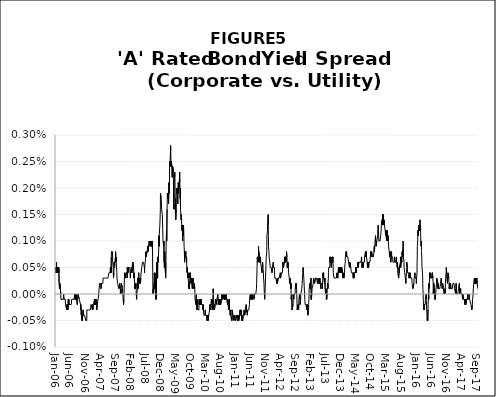
| Category | Series 1 |
|---|---|
| 2006-01-03 | 0 |
| 2006-01-04 | 0 |
| 2006-01-05 | 0.001 |
| 2006-01-06 | 0.001 |
| 2006-01-09 | 0 |
| 2006-01-10 | 0.001 |
| 2006-01-11 | 0.001 |
| 2006-01-12 | 0 |
| 2006-01-13 | 0 |
| 2006-01-17 | 0.001 |
| 2006-01-18 | 0.001 |
| 2006-01-19 | 0.001 |
| 2006-01-20 | 0.001 |
| 2006-01-23 | 0.001 |
| 2006-01-24 | 0 |
| 2006-01-25 | 0.001 |
| 2006-01-26 | 0 |
| 2006-01-27 | 0 |
| 2006-01-30 | 0.001 |
| 2006-01-31 | 0 |
| 2006-02-01 | 0 |
| 2006-02-02 | 0 |
| 2006-02-03 | 0 |
| 2006-02-06 | 0.001 |
| 2006-02-07 | 0.001 |
| 2006-02-08 | 0.001 |
| 2006-02-09 | 0 |
| 2006-02-10 | 0.001 |
| 2006-02-13 | 0 |
| 2006-02-14 | 0 |
| 2006-02-15 | 0 |
| 2006-02-16 | 0 |
| 2006-02-17 | 0 |
| 2006-02-21 | 0 |
| 2006-02-22 | 0 |
| 2006-02-23 | 0 |
| 2006-02-27 | 0 |
| 2006-02-28 | 0 |
| 2006-03-01 | 0 |
| 2006-03-02 | 0 |
| 2006-03-03 | 0 |
| 2006-03-06 | 0 |
| 2006-03-07 | 0 |
| 2006-03-08 | 0 |
| 2006-03-09 | 0 |
| 2006-03-10 | 0 |
| 2006-03-13 | 0 |
| 2006-03-14 | 0 |
| 2006-03-16 | 0 |
| 2006-03-17 | 0 |
| 2006-03-20 | 0 |
| 2006-03-21 | 0 |
| 2006-03-22 | 0 |
| 2006-03-23 | 0 |
| 2006-03-24 | 0 |
| 2006-03-27 | 0 |
| 2006-03-28 | 0 |
| 2006-03-30 | 0 |
| 2006-03-31 | 0 |
| 2006-04-03 | 0 |
| 2006-04-04 | 0 |
| 2006-04-05 | 0 |
| 2006-04-06 | 0 |
| 2006-04-10 | 0 |
| 2006-04-11 | 0 |
| 2006-04-12 | 0 |
| 2006-04-13 | 0 |
| 2006-04-17 | 0 |
| 2006-04-19 | 0 |
| 2006-04-21 | 0 |
| 2006-04-24 | 0 |
| 2006-04-25 | 0 |
| 2006-04-26 | 0 |
| 2006-04-27 | 0 |
| 2006-04-28 | 0 |
| 2006-05-01 | 0 |
| 2006-05-02 | 0 |
| 2006-05-03 | 0 |
| 2006-05-04 | 0 |
| 2006-05-05 | 0 |
| 2006-05-08 | 0 |
| 2006-05-09 | 0 |
| 2006-05-10 | 0 |
| 2006-05-11 | 0 |
| 2006-05-12 | 0 |
| 2006-05-15 | 0 |
| 2006-05-16 | 0 |
| 2006-05-17 | 0 |
| 2006-05-18 | 0 |
| 2006-05-19 | 0 |
| 2006-05-22 | 0 |
| 2006-05-24 | 0 |
| 2006-05-25 | 0 |
| 2006-05-26 | 0 |
| 2006-05-30 | 0 |
| 2006-05-31 | 0 |
| 2006-06-01 | 0 |
| 2006-06-02 | 0 |
| 2006-06-05 | 0 |
| 2006-06-06 | 0 |
| 2006-06-07 | 0 |
| 2006-06-09 | 0 |
| 2006-06-12 | 0 |
| 2006-06-13 | 0 |
| 2006-06-14 | 0 |
| 2006-06-15 | 0 |
| 2006-06-16 | 0 |
| 2006-06-19 | 0 |
| 2006-06-20 | 0 |
| 2006-06-21 | 0 |
| 2006-06-22 | 0 |
| 2006-06-23 | 0 |
| 2006-06-26 | 0 |
| 2006-06-28 | 0 |
| 2006-06-29 | 0 |
| 2006-07-03 | 0 |
| 2006-07-05 | 0 |
| 2006-07-06 | 0 |
| 2006-07-07 | 0 |
| 2006-07-10 | 0 |
| 2006-07-11 | 0 |
| 2006-07-12 | 0 |
| 2006-07-14 | 0 |
| 2006-07-17 | 0 |
| 2006-07-18 | 0 |
| 2006-07-19 | 0 |
| 2006-07-20 | 0 |
| 2006-07-21 | 0 |
| 2006-07-24 | 0 |
| 2006-07-25 | 0 |
| 2006-07-26 | 0 |
| 2006-07-27 | 0 |
| 2006-07-28 | 0 |
| 2006-07-31 | 0 |
| 2006-08-01 | 0 |
| 2006-08-02 | 0 |
| 2006-08-03 | 0 |
| 2006-08-04 | 0 |
| 2006-08-07 | 0 |
| 2006-08-08 | 0 |
| 2006-08-09 | 0 |
| 2006-08-11 | 0 |
| 2006-08-14 | 0 |
| 2006-08-15 | 0 |
| 2006-08-16 | 0 |
| 2006-08-17 | 0 |
| 2006-08-21 | 0 |
| 2006-08-23 | 0 |
| 2006-08-24 | 0 |
| 2006-08-28 | 0 |
| 2006-08-29 | 0 |
| 2006-08-30 | 0 |
| 2006-09-01 | 0 |
| 2006-09-05 | 0 |
| 2006-09-06 | 0 |
| 2006-09-07 | 0 |
| 2006-09-08 | 0 |
| 2006-09-11 | 0 |
| 2006-09-12 | 0 |
| 2006-09-14 | 0 |
| 2006-09-15 | 0 |
| 2006-09-18 | 0 |
| 2006-09-19 | 0 |
| 2006-09-20 | 0 |
| 2006-09-21 | 0 |
| 2006-09-25 | 0 |
| 2006-09-26 | 0 |
| 2006-09-28 | 0 |
| 2006-09-29 | 0 |
| 2006-10-02 | 0 |
| 2006-10-03 | 0 |
| 2006-10-04 | -0.001 |
| 2006-10-05 | 0 |
| 2006-10-06 | -0.001 |
| 2006-10-10 | 0 |
| 2006-10-11 | 0 |
| 2006-10-13 | 0 |
| 2006-10-17 | 0 |
| 2006-10-18 | 0 |
| 2006-10-19 | 0 |
| 2006-10-23 | 0 |
| 2006-10-24 | 0 |
| 2006-10-26 | 0 |
| 2006-10-27 | 0 |
| 2006-10-30 | 0 |
| 2006-10-31 | 0 |
| 2006-11-01 | 0 |
| 2006-11-03 | 0 |
| 2006-11-06 | 0 |
| 2006-11-07 | 0 |
| 2006-11-09 | -0.001 |
| 2006-11-10 | -0.001 |
| 2006-11-13 | -0.001 |
| 2006-11-15 | -0.001 |
| 2006-11-16 | -0.001 |
| 2006-11-17 | -0.001 |
| 2006-11-20 | -0.001 |
| 2006-11-21 | 0 |
| 2006-11-24 | 0 |
| 2006-11-27 | 0 |
| 2006-11-28 | 0 |
| 2006-11-30 | 0 |
| 2006-12-04 | 0 |
| 2006-12-05 | 0 |
| 2006-12-07 | 0 |
| 2006-12-08 | 0 |
| 2006-12-11 | 0 |
| 2006-12-12 | 0 |
| 2006-12-14 | 0 |
| 2006-12-15 | 0 |
| 2006-12-18 | 0 |
| 2006-12-19 | 0 |
| 2006-12-20 | 0 |
| 2006-12-21 | 0 |
| 2006-12-26 | 0 |
| 2006-12-28 | 0 |
| 2006-12-29 | 0 |
| 2007-01-02 | 0 |
| 2007-01-03 | 0 |
| 2007-01-04 | 0 |
| 2007-01-05 | 0 |
| 2007-01-08 | 0 |
| 2007-01-09 | 0 |
| 2007-01-11 | 0 |
| 2007-01-12 | 0 |
| 2007-01-17 | 0 |
| 2007-01-18 | 0 |
| 2007-01-19 | 0 |
| 2007-01-22 | 0 |
| 2007-01-23 | 0 |
| 2007-01-24 | 0 |
| 2007-01-26 | 0 |
| 2007-01-30 | 0 |
| 2007-01-31 | 0 |
| 2007-02-01 | 0 |
| 2007-02-02 | 0 |
| 2007-02-06 | 0 |
| 2007-02-07 | 0 |
| 2007-02-08 | 0 |
| 2007-02-09 | 0 |
| 2007-02-12 | 0 |
| 2007-02-13 | 0 |
| 2007-02-14 | 0 |
| 2007-02-15 | 0 |
| 2007-02-16 | 0 |
| 2007-02-20 | 0 |
| 2007-02-21 | 0 |
| 2007-02-22 | 0 |
| 2007-02-26 | 0 |
| 2007-02-27 | 0 |
| 2007-02-28 | 0 |
| 2007-03-01 | 0 |
| 2007-03-02 | 0 |
| 2007-03-05 | 0 |
| 2007-03-07 | 0 |
| 2007-03-08 | 0 |
| 2007-03-09 | 0 |
| 2007-03-12 | 0 |
| 2007-03-13 | 0 |
| 2007-03-15 | 0 |
| 2007-03-16 | 0 |
| 2007-03-19 | 0 |
| 2007-03-21 | 0 |
| 2007-03-22 | 0 |
| 2007-03-26 | 0 |
| 2007-03-28 | 0 |
| 2007-03-29 | 0 |
| 2007-03-30 | 0 |
| 2007-04-03 | 0 |
| 2007-04-04 | 0 |
| 2007-04-05 | 0 |
| 2007-04-09 | 0 |
| 2007-04-10 | 0 |
| 2007-04-12 | 0 |
| 2007-04-16 | 0 |
| 2007-04-17 | 0 |
| 2007-04-18 | 0 |
| 2007-04-19 | 0 |
| 2007-04-20 | 0 |
| 2007-04-23 | 0 |
| 2007-04-25 | 0 |
| 2007-04-27 | 0 |
| 2007-05-01 | 0 |
| 2007-05-02 | 0 |
| 2007-05-03 | 0 |
| 2007-05-04 | 0 |
| 2007-05-08 | 0 |
| 2007-05-09 | 0 |
| 2007-05-10 | 0 |
| 2007-05-14 | 0 |
| 2007-05-15 | 0 |
| 2007-05-16 | 0 |
| 2007-05-17 | 0 |
| 2007-05-18 | 0 |
| 2007-05-21 | 0 |
| 2007-05-22 | 0 |
| 2007-05-24 | 0 |
| 2007-05-25 | 0 |
| 2007-05-29 | 0 |
| 2007-05-31 | 0 |
| 2007-06-01 | 0 |
| 2007-06-04 | 0 |
| 2007-06-05 | 0 |
| 2007-06-06 | 0 |
| 2007-06-08 | 0 |
| 2007-06-11 | 0 |
| 2007-06-12 | 0 |
| 2007-06-13 | 0 |
| 2007-06-14 | 0 |
| 2007-06-18 | 0 |
| 2007-06-20 | 0 |
| 2007-06-21 | 0 |
| 2007-06-22 | 0 |
| 2007-06-26 | 0 |
| 2007-06-27 | 0 |
| 2007-06-28 | 0 |
| 2007-06-29 | 0 |
| 2007-07-02 | 0 |
| 2007-07-03 | 0 |
| 2007-07-05 | 0 |
| 2007-07-06 | 0 |
| 2007-07-09 | 0 |
| 2007-07-10 | 0 |
| 2007-07-11 | 0 |
| 2007-07-12 | 0 |
| 2007-07-13 | 0 |
| 2007-07-16 | 0 |
| 2007-07-17 | 0.001 |
| 2007-07-18 | 0 |
| 2007-07-19 | 0 |
| 2007-07-20 | 0 |
| 2007-07-23 | 0.001 |
| 2007-07-24 | 0 |
| 2007-07-26 | 0.001 |
| 2007-07-27 | 0.001 |
| 2007-07-30 | 0.001 |
| 2007-08-01 | 0.001 |
| 2007-08-02 | 0.001 |
| 2007-08-03 | 0.001 |
| 2007-08-06 | 0.001 |
| 2007-08-07 | 0.001 |
| 2007-08-09 | 0.001 |
| 2007-08-10 | 0.001 |
| 2007-08-13 | 0.001 |
| 2007-08-14 | 0.001 |
| 2007-08-15 | 0 |
| 2007-08-16 | 0 |
| 2007-08-17 | 0 |
| 2007-08-20 | 0 |
| 2007-08-21 | 0 |
| 2007-08-22 | 0.001 |
| 2007-08-23 | 0.001 |
| 2007-08-24 | 0.001 |
| 2007-08-28 | 0.001 |
| 2007-08-30 | 0.001 |
| 2007-08-31 | 0.001 |
| 2007-09-05 | 0.001 |
| 2007-09-06 | 0.001 |
| 2007-09-07 | 0.001 |
| 2007-09-10 | 0.001 |
| 2007-09-11 | 0.001 |
| 2007-09-12 | 0.001 |
| 2007-09-13 | 0.001 |
| 2007-09-17 | 0.001 |
| 2007-09-18 | 0.001 |
| 2007-09-19 | 0.001 |
| 2007-09-20 | 0 |
| 2007-09-21 | 0 |
| 2007-09-25 | 0 |
| 2007-09-26 | 0 |
| 2007-09-27 | 0 |
| 2007-09-28 | 0 |
| 2007-10-01 | 0 |
| 2007-10-03 | 0 |
| 2007-10-04 | 0 |
| 2007-10-05 | 0 |
| 2007-10-10 | 0 |
| 2007-10-11 | 0 |
| 2007-10-12 | 0 |
| 2007-10-15 | 0 |
| 2007-10-16 | 0 |
| 2007-10-18 | 0 |
| 2007-10-19 | 0 |
| 2007-10-23 | 0 |
| 2007-10-25 | 0 |
| 2007-10-26 | 0 |
| 2007-10-29 | 0 |
| 2007-10-30 | 0 |
| 2007-10-31 | 0 |
| 2007-11-01 | 0 |
| 2007-11-02 | 0 |
| 2007-11-05 | 0 |
| 2007-11-06 | 0 |
| 2007-11-08 | 0 |
| 2007-11-09 | 0 |
| 2007-11-13 | 0 |
| 2007-11-16 | 0 |
| 2007-11-19 | 0 |
| 2007-11-23 | 0 |
| 2007-11-26 | 0 |
| 2007-11-27 | 0 |
| 2007-11-28 | 0 |
| 2007-11-30 | 0 |
| 2007-12-03 | 0 |
| 2007-12-05 | 0 |
| 2007-12-07 | 0 |
| 2007-12-10 | 0 |
| 2007-12-11 | 0 |
| 2007-12-12 | 0 |
| 2007-12-13 | 0 |
| 2007-12-14 | 0 |
| 2007-12-17 | 0 |
| 2007-12-18 | 0 |
| 2007-12-19 | 0 |
| 2007-12-20 | 0 |
| 2007-12-24 | 0 |
| 2007-12-27 | 0 |
| 2007-12-31 | 0 |
| 2008-01-02 | 0 |
| 2008-01-04 | 0.001 |
| 2008-01-07 | 0.001 |
| 2008-01-08 | 0 |
| 2008-01-09 | 0 |
| 2008-01-10 | 0 |
| 2008-01-14 | 0 |
| 2008-01-15 | 0 |
| 2008-01-16 | 0 |
| 2008-01-17 | 0.001 |
| 2008-01-18 | 0.001 |
| 2008-01-22 | 0.001 |
| 2008-01-24 | 0 |
| 2008-01-25 | 0 |
| 2008-01-29 | 0.001 |
| 2008-01-30 | 0.001 |
| 2008-02-01 | 0 |
| 2008-02-04 | 0 |
| 2008-02-05 | 0 |
| 2008-02-06 | 0 |
| 2008-02-07 | 0 |
| 2008-02-08 | 0 |
| 2008-02-11 | 0 |
| 2008-02-12 | 0 |
| 2008-02-14 | 0.001 |
| 2008-02-15 | 0.001 |
| 2008-02-20 | 0 |
| 2008-02-21 | 0 |
| 2008-02-22 | 0.001 |
| 2008-02-25 | 0.001 |
| 2008-02-26 | 0.001 |
| 2008-02-27 | 0.001 |
| 2008-02-28 | 0.001 |
| 2008-02-29 | 0.001 |
| 2008-03-03 | 0.001 |
| 2008-03-04 | 0.001 |
| 2008-03-05 | 0.001 |
| 2008-03-06 | 0.001 |
| 2008-03-07 | 0.001 |
| 2008-03-10 | 0 |
| 2008-03-11 | 0 |
| 2008-03-12 | 0 |
| 2008-03-13 | 0 |
| 2008-03-14 | 0 |
| 2008-03-17 | 0 |
| 2008-03-18 | 0 |
| 2008-03-19 | 0 |
| 2008-03-20 | 0 |
| 2008-03-24 | 0 |
| 2008-03-25 | 0 |
| 2008-03-26 | 0 |
| 2008-03-27 | 0 |
| 2008-03-28 | 0 |
| 2008-03-31 | 0 |
| 2008-04-01 | 0 |
| 2008-04-02 | 0 |
| 2008-04-03 | 0 |
| 2008-04-04 | 0 |
| 2008-04-07 | 0 |
| 2008-04-08 | 0 |
| 2008-04-09 | 0 |
| 2008-04-10 | 0 |
| 2008-04-11 | 0 |
| 2008-04-15 | 0 |
| 2008-04-16 | 0 |
| 2008-04-17 | 0 |
| 2008-04-18 | 0 |
| 2008-04-21 | 0 |
| 2008-04-22 | 0 |
| 2008-04-23 | 0 |
| 2008-04-24 | 0 |
| 2008-04-25 | 0 |
| 2008-04-28 | 0 |
| 2008-04-29 | 0 |
| 2008-04-30 | 0 |
| 2008-05-01 | 0 |
| 2008-05-02 | 0 |
| 2008-05-05 | 0 |
| 2008-05-06 | 0 |
| 2008-05-07 | 0 |
| 2008-05-08 | 0 |
| 2008-05-09 | 0 |
| 2008-05-12 | 0 |
| 2008-05-13 | 0 |
| 2008-05-15 | 0 |
| 2008-05-16 | 0 |
| 2008-05-19 | 0 |
| 2008-05-20 | 0 |
| 2008-05-21 | 0 |
| 2008-05-22 | 0 |
| 2008-05-23 | 0 |
| 2008-05-27 | 0 |
| 2008-05-28 | 0 |
| 2008-05-29 | 0.001 |
| 2008-05-30 | 0.001 |
| 2008-06-02 | 0.001 |
| 2008-06-03 | 0.001 |
| 2008-06-04 | 0.001 |
| 2008-06-05 | 0.001 |
| 2008-06-06 | 0.001 |
| 2008-06-09 | 0.001 |
| 2008-06-10 | 0.001 |
| 2008-06-11 | 0.001 |
| 2008-06-13 | 0.001 |
| 2008-06-16 | 0.001 |
| 2008-06-17 | 0.001 |
| 2008-06-18 | 0.001 |
| 2008-06-19 | 0.001 |
| 2008-06-20 | 0.001 |
| 2008-06-23 | 0.001 |
| 2008-06-24 | 0.001 |
| 2008-06-25 | 0.001 |
| 2008-06-26 | 0 |
| 2008-06-27 | 0.001 |
| 2008-06-30 | 0.001 |
| 2008-07-01 | 0.001 |
| 2008-07-02 | 0.001 |
| 2008-07-03 | 0.001 |
| 2008-07-07 | 0.001 |
| 2008-07-08 | 0.001 |
| 2008-07-09 | 0.001 |
| 2008-07-10 | 0.001 |
| 2008-07-11 | 0.001 |
| 2008-07-14 | 0.001 |
| 2008-07-15 | 0.001 |
| 2008-07-16 | 0.001 |
| 2008-07-17 | 0.001 |
| 2008-07-18 | 0.001 |
| 2008-07-21 | 0.001 |
| 2008-07-22 | 0.001 |
| 2008-07-23 | 0.001 |
| 2008-07-24 | 0.001 |
| 2008-07-25 | 0.001 |
| 2008-07-28 | 0.001 |
| 2008-07-29 | 0.001 |
| 2008-07-30 | 0.001 |
| 2008-07-31 | 0.001 |
| 2008-08-01 | 0.001 |
| 2008-08-04 | 0.001 |
| 2008-08-05 | 0.001 |
| 2008-08-06 | 0.001 |
| 2008-08-07 | 0.001 |
| 2008-08-11 | 0.001 |
| 2008-08-12 | 0.001 |
| 2008-08-13 | 0.001 |
| 2008-08-14 | 0.001 |
| 2008-08-15 | 0.001 |
| 2008-08-18 | 0.001 |
| 2008-08-19 | 0.001 |
| 2008-08-20 | 0.001 |
| 2008-08-21 | 0.001 |
| 2008-08-22 | 0.001 |
| 2008-08-25 | 0.001 |
| 2008-08-26 | 0.001 |
| 2008-08-27 | 0.001 |
| 2008-08-28 | 0.001 |
| 2008-08-29 | 0.001 |
| 2008-09-02 | 0.001 |
| 2008-09-03 | 0.001 |
| 2008-09-04 | 0.001 |
| 2008-09-05 | 0.001 |
| 2008-09-08 | 0.001 |
| 2008-09-09 | 0.001 |
| 2008-09-10 | 0.001 |
| 2008-09-11 | 0.001 |
| 2008-09-12 | 0.001 |
| 2008-09-15 | 0.001 |
| 2008-09-17 | 0 |
| 2008-09-18 | 0 |
| 2008-09-19 | 0 |
| 2008-09-22 | 0 |
| 2008-09-23 | 0 |
| 2008-09-25 | 0 |
| 2008-09-29 | 0 |
| 2008-09-30 | 0 |
| 2008-10-01 | 0 |
| 2008-10-03 | 0 |
| 2008-10-06 | 0 |
| 2008-10-07 | 0 |
| 2008-10-08 | 0 |
| 2008-10-09 | 0 |
| 2008-10-10 | 0 |
| 2008-10-14 | 0 |
| 2008-10-15 | 0 |
| 2008-10-16 | 0 |
| 2008-10-17 | 0 |
| 2008-10-20 | 0 |
| 2008-10-21 | 0 |
| 2008-10-22 | 0 |
| 2008-10-23 | 0 |
| 2008-10-24 | 0 |
| 2008-10-27 | 0 |
| 2008-10-28 | 0.001 |
| 2008-10-29 | 0 |
| 2008-10-30 | 0.001 |
| 2008-10-31 | 0.001 |
| 2008-11-03 | 0 |
| 2008-11-04 | 0 |
| 2008-11-05 | 0 |
| 2008-11-06 | 0.001 |
| 2008-11-07 | 0.001 |
| 2008-11-10 | 0.001 |
| 2008-11-12 | 0.001 |
| 2008-11-13 | 0.001 |
| 2008-11-14 | 0.001 |
| 2008-11-17 | 0.001 |
| 2008-11-18 | 0.001 |
| 2008-11-19 | 0.001 |
| 2008-11-20 | 0.001 |
| 2008-11-21 | 0.001 |
| 2008-11-24 | 0.001 |
| 2008-11-25 | 0.001 |
| 2008-11-28 | 0.001 |
| 2008-12-01 | 0.001 |
| 2008-12-02 | 0.001 |
| 2008-12-03 | 0.002 |
| 2008-12-04 | 0.002 |
| 2008-12-05 | 0.002 |
| 2008-12-08 | 0.002 |
| 2008-12-09 | 0.002 |
| 2008-12-10 | 0.002 |
| 2008-12-11 | 0.002 |
| 2008-12-12 | 0.002 |
| 2008-12-15 | 0.002 |
| 2008-12-16 | 0.002 |
| 2008-12-17 | 0.002 |
| 2008-12-18 | 0.002 |
| 2008-12-19 | 0.002 |
| 2008-12-23 | 0.001 |
| 2008-12-30 | 0.001 |
| 2009-01-02 | 0.001 |
| 2009-01-05 | 0.001 |
| 2009-01-06 | 0.001 |
| 2009-01-07 | 0.001 |
| 2009-01-08 | 0.001 |
| 2009-01-09 | 0.001 |
| 2009-01-12 | 0.001 |
| 2009-01-13 | 0.001 |
| 2009-01-14 | 0.001 |
| 2009-01-15 | 0.001 |
| 2009-01-16 | 0.001 |
| 2009-01-23 | 0 |
| 2009-01-26 | 0 |
| 2009-01-28 | 0.001 |
| 2009-01-29 | 0.001 |
| 2009-01-30 | 0.001 |
| 2009-02-02 | 0.001 |
| 2009-02-03 | 0.001 |
| 2009-02-04 | 0.001 |
| 2009-02-05 | 0.001 |
| 2009-02-06 | 0.001 |
| 2009-02-09 | 0.002 |
| 2009-02-10 | 0.002 |
| 2009-02-11 | 0.002 |
| 2009-02-12 | 0.002 |
| 2009-02-13 | 0.002 |
| 2009-02-17 | 0.002 |
| 2009-02-18 | 0.002 |
| 2009-02-19 | 0.002 |
| 2009-02-20 | 0.002 |
| 2009-02-23 | 0.002 |
| 2009-02-24 | 0.002 |
| 2009-02-25 | 0.002 |
| 2009-02-26 | 0.002 |
| 2009-02-27 | 0.002 |
| 2009-03-02 | 0.002 |
| 2009-03-03 | 0.002 |
| 2009-03-04 | 0.002 |
| 2009-03-05 | 0.002 |
| 2009-03-06 | 0.002 |
| 2009-03-09 | 0.003 |
| 2009-03-10 | 0.002 |
| 2009-03-11 | 0.003 |
| 2009-03-12 | 0.003 |
| 2009-03-13 | 0.003 |
| 2009-03-16 | 0.003 |
| 2009-03-17 | 0.003 |
| 2009-03-18 | 0.003 |
| 2009-03-19 | 0.003 |
| 2009-03-20 | 0.003 |
| 2009-03-23 | 0.002 |
| 2009-03-24 | 0.003 |
| 2009-03-25 | 0.003 |
| 2009-03-30 | 0.002 |
| 2009-03-31 | 0.002 |
| 2009-04-01 | 0.002 |
| 2009-04-02 | 0.002 |
| 2009-04-03 | 0.002 |
| 2009-04-06 | 0.002 |
| 2009-04-07 | 0.002 |
| 2009-04-08 | 0.002 |
| 2009-04-09 | 0.002 |
| 2009-04-13 | 0.002 |
| 2009-04-14 | 0.002 |
| 2009-04-15 | 0.002 |
| 2009-04-16 | 0.002 |
| 2009-04-17 | 0.002 |
| 2009-04-20 | 0.002 |
| 2009-04-21 | 0.002 |
| 2009-04-22 | 0.002 |
| 2009-04-23 | 0.002 |
| 2009-04-24 | 0.002 |
| 2009-04-27 | 0.002 |
| 2009-04-28 | 0.002 |
| 2009-04-29 | 0.002 |
| 2009-04-30 | 0.002 |
| 2009-05-01 | 0.002 |
| 2009-05-04 | 0.002 |
| 2009-05-05 | 0.002 |
| 2009-05-06 | 0.002 |
| 2009-05-07 | 0.002 |
| 2009-05-08 | 0.001 |
| 2009-05-11 | 0.001 |
| 2009-05-12 | 0.002 |
| 2009-05-13 | 0.002 |
| 2009-05-14 | 0.002 |
| 2009-05-15 | 0.002 |
| 2009-05-18 | 0.002 |
| 2009-05-19 | 0.002 |
| 2009-05-20 | 0.002 |
| 2009-05-21 | 0.002 |
| 2009-05-22 | 0.002 |
| 2009-05-26 | 0.002 |
| 2009-05-27 | 0.002 |
| 2009-05-28 | 0.002 |
| 2009-05-29 | 0.002 |
| 2009-06-01 | 0.002 |
| 2009-06-02 | 0.002 |
| 2009-06-03 | 0.002 |
| 2009-06-04 | 0.002 |
| 2009-06-05 | 0.002 |
| 2009-06-09 | 0.002 |
| 2009-06-10 | 0.002 |
| 2009-06-11 | 0.002 |
| 2009-06-12 | 0.002 |
| 2009-06-15 | 0.002 |
| 2009-06-16 | 0.002 |
| 2009-06-17 | 0.002 |
| 2009-06-18 | 0.002 |
| 2009-06-19 | 0.002 |
| 2009-06-22 | 0.002 |
| 2009-06-23 | 0.002 |
| 2009-06-24 | 0.002 |
| 2009-06-25 | 0.002 |
| 2009-06-26 | 0.002 |
| 2009-06-29 | 0.002 |
| 2009-06-30 | 0.002 |
| 2009-07-01 | 0.001 |
| 2009-07-02 | 0.002 |
| 2009-07-06 | 0.001 |
| 2009-07-07 | 0.001 |
| 2009-07-08 | 0.001 |
| 2009-07-09 | 0.001 |
| 2009-07-10 | 0.001 |
| 2009-07-13 | 0.001 |
| 2009-07-14 | 0.001 |
| 2009-07-16 | 0.001 |
| 2009-07-17 | 0.001 |
| 2009-07-20 | 0.001 |
| 2009-07-21 | 0.001 |
| 2009-07-22 | 0.001 |
| 2009-07-23 | 0.001 |
| 2009-07-24 | 0.001 |
| 2009-07-27 | 0.001 |
| 2009-07-28 | 0.001 |
| 2009-07-29 | 0.001 |
| 2009-07-30 | 0.001 |
| 2009-07-31 | 0.001 |
| 2009-08-03 | 0.001 |
| 2009-08-04 | 0.001 |
| 2009-08-05 | 0.001 |
| 2009-08-06 | 0.001 |
| 2009-08-07 | 0.001 |
| 2009-08-10 | 0.001 |
| 2009-08-11 | 0.001 |
| 2009-08-12 | 0.001 |
| 2009-08-13 | 0.001 |
| 2009-08-14 | 0.001 |
| 2009-08-17 | 0.001 |
| 2009-08-18 | 0.001 |
| 2009-08-19 | 0.001 |
| 2009-08-20 | 0.001 |
| 2009-08-21 | 0.001 |
| 2009-08-24 | 0.001 |
| 2009-08-25 | 0.001 |
| 2009-08-26 | 0.001 |
| 2009-08-27 | 0.001 |
| 2009-08-28 | 0.001 |
| 2009-08-31 | 0 |
| 2009-09-01 | 0 |
| 2009-09-02 | 0.001 |
| 2009-09-03 | 0 |
| 2009-09-04 | 0 |
| 2009-09-08 | 0 |
| 2009-09-09 | 0 |
| 2009-09-10 | 0 |
| 2009-09-11 | 0 |
| 2009-09-14 | 0 |
| 2009-09-15 | 0 |
| 2009-09-16 | 0 |
| 2009-09-17 | 0 |
| 2009-09-18 | 0 |
| 2009-09-21 | 0 |
| 2009-09-22 | 0 |
| 2009-09-23 | 0 |
| 2009-09-24 | 0 |
| 2009-09-25 | 0 |
| 2009-09-28 | 0 |
| 2009-09-29 | 0 |
| 2009-09-30 | 0 |
| 2009-10-01 | 0 |
| 2009-10-02 | 0 |
| 2009-10-05 | 0 |
| 2009-10-06 | 0 |
| 2009-10-07 | 0 |
| 2009-10-08 | 0 |
| 2009-10-09 | 0 |
| 2009-10-13 | 0 |
| 2009-10-14 | 0 |
| 2009-10-15 | 0 |
| 2009-10-16 | 0 |
| 2009-10-19 | 0 |
| 2009-10-20 | 0 |
| 2009-10-21 | 0 |
| 2009-10-22 | 0 |
| 2009-10-23 | 0 |
| 2009-10-29 | 0 |
| 2009-10-30 | 0 |
| 2009-11-02 | 0 |
| 2009-11-03 | 0 |
| 2009-11-04 | 0 |
| 2009-11-05 | 0 |
| 2009-11-06 | 0 |
| 2009-11-09 | 0 |
| 2009-11-10 | 0 |
| 2009-11-12 | 0 |
| 2009-11-13 | 0 |
| 2009-11-16 | 0 |
| 2009-11-17 | 0 |
| 2009-11-18 | 0 |
| 2009-11-19 | 0 |
| 2009-11-20 | 0 |
| 2009-11-27 | 0 |
| 2009-11-30 | 0 |
| 2009-12-01 | 0 |
| 2009-12-02 | 0 |
| 2009-12-03 | 0 |
| 2009-12-08 | 0 |
| 2009-12-09 | 0 |
| 2009-12-10 | 0 |
| 2009-12-11 | 0 |
| 2009-12-14 | 0 |
| 2009-12-15 | 0 |
| 2009-12-16 | 0 |
| 2009-12-17 | 0 |
| 2009-12-18 | 0 |
| 2009-12-21 | 0 |
| 2009-12-22 | 0 |
| 2009-12-24 | 0 |
| 2009-12-28 | 0 |
| 2009-12-29 | 0 |
| 2009-12-30 | 0 |
| 2009-12-31 | 0 |
| 2010-01-04 | 0 |
| 2010-01-05 | 0 |
| 2010-01-06 | 0 |
| 2010-01-07 | 0 |
| 2010-01-08 | 0 |
| 2010-01-11 | 0 |
| 2010-01-12 | 0 |
| 2010-01-13 | 0 |
| 2010-01-14 | 0 |
| 2010-01-15 | 0 |
| 2010-01-19 | 0 |
| 2010-01-20 | 0 |
| 2010-01-21 | 0 |
| 2010-01-22 | 0 |
| 2010-01-25 | 0 |
| 2010-01-26 | 0 |
| 2010-01-27 | 0 |
| 2010-01-28 | 0 |
| 2010-01-29 | 0 |
| 2010-02-01 | 0 |
| 2010-02-02 | 0 |
| 2010-02-03 | 0 |
| 2010-02-04 | 0 |
| 2010-02-05 | 0 |
| 2010-02-08 | 0 |
| 2010-02-09 | 0 |
| 2010-02-10 | 0 |
| 2010-02-11 | 0 |
| 2010-02-12 | 0 |
| 2010-02-16 | 0 |
| 2010-02-17 | 0 |
| 2010-02-18 | 0 |
| 2010-02-19 | 0 |
| 2010-02-22 | 0 |
| 2010-02-23 | 0 |
| 2010-02-24 | 0 |
| 2010-02-25 | 0 |
| 2010-02-26 | 0 |
| 2010-03-01 | 0 |
| 2010-03-02 | 0 |
| 2010-03-03 | 0 |
| 2010-03-04 | 0 |
| 2010-03-05 | 0 |
| 2010-03-08 | 0 |
| 2010-03-09 | 0 |
| 2010-03-12 | 0 |
| 2010-03-15 | 0 |
| 2010-03-16 | 0 |
| 2010-03-17 | 0 |
| 2010-03-18 | 0 |
| 2010-03-19 | -0.001 |
| 2010-03-22 | -0.001 |
| 2010-03-23 | 0 |
| 2010-03-24 | 0 |
| 2010-03-25 | -0.001 |
| 2010-03-26 | -0.001 |
| 2010-03-29 | -0.001 |
| 2010-03-30 | -0.001 |
| 2010-03-31 | 0 |
| 2010-04-01 | 0 |
| 2010-04-02 | -0.001 |
| 2010-04-05 | -0.001 |
| 2010-04-06 | 0 |
| 2010-04-07 | 0 |
| 2010-04-08 | 0 |
| 2010-04-09 | 0 |
| 2010-04-12 | 0 |
| 2010-04-13 | 0 |
| 2010-04-14 | 0 |
| 2010-04-15 | 0 |
| 2010-04-16 | 0 |
| 2010-04-19 | 0 |
| 2010-04-21 | 0 |
| 2010-04-22 | 0 |
| 2010-04-23 | 0 |
| 2010-04-26 | 0 |
| 2010-04-28 | 0 |
| 2010-04-29 | 0 |
| 2010-04-30 | 0 |
| 2010-05-03 | 0 |
| 2010-05-04 | 0 |
| 2010-05-05 | 0 |
| 2010-05-06 | 0 |
| 2010-05-07 | 0 |
| 2010-05-10 | 0 |
| 2010-05-11 | 0 |
| 2010-05-12 | 0 |
| 2010-05-13 | 0 |
| 2010-05-14 | 0 |
| 2010-05-17 | 0 |
| 2010-05-18 | 0 |
| 2010-05-19 | 0 |
| 2010-05-21 | 0 |
| 2010-05-24 | 0 |
| 2010-05-25 | 0 |
| 2010-05-26 | 0 |
| 2010-05-27 | 0 |
| 2010-05-28 | 0 |
| 2010-06-01 | 0 |
| 2010-06-02 | 0 |
| 2010-06-03 | 0 |
| 2010-06-04 | 0 |
| 2010-06-07 | 0 |
| 2010-06-08 | 0 |
| 2010-06-09 | 0 |
| 2010-06-10 | 0 |
| 2010-06-11 | 0 |
| 2010-06-14 | 0 |
| 2010-06-15 | 0 |
| 2010-06-16 | 0 |
| 2010-06-17 | 0 |
| 2010-06-18 | 0 |
| 2010-06-21 | 0 |
| 2010-06-22 | 0 |
| 2010-06-23 | 0 |
| 2010-06-25 | 0 |
| 2010-06-28 | 0 |
| 2010-07-01 | 0 |
| 2010-07-02 | 0 |
| 2010-07-06 | 0 |
| 2010-07-07 | 0 |
| 2010-07-09 | 0 |
| 2010-07-12 | 0 |
| 2010-07-13 | 0 |
| 2010-07-14 | 0 |
| 2010-07-15 | 0 |
| 2010-07-19 | 0 |
| 2010-07-20 | 0 |
| 2010-07-21 | 0 |
| 2010-07-22 | 0 |
| 2010-07-23 | 0 |
| 2010-07-26 | 0 |
| 2010-07-27 | 0 |
| 2010-07-28 | 0 |
| 2010-07-29 | 0 |
| 2010-07-30 | 0 |
| 2010-08-02 | 0 |
| 2010-08-03 | 0 |
| 2010-08-04 | 0 |
| 2010-08-05 | 0 |
| 2010-08-06 | 0 |
| 2010-08-09 | 0 |
| 2010-08-10 | 0 |
| 2010-08-12 | 0 |
| 2010-08-13 | 0 |
| 2010-08-16 | 0 |
| 2010-08-17 | 0 |
| 2010-08-19 | 0 |
| 2010-08-20 | 0 |
| 2010-08-23 | 0 |
| 2010-08-24 | 0 |
| 2010-08-27 | 0 |
| 2010-08-31 | 0 |
| 2010-09-01 | 0 |
| 2010-09-02 | 0 |
| 2010-09-03 | 0 |
| 2010-09-07 | 0 |
| 2010-09-08 | 0 |
| 2010-09-09 | 0 |
| 2010-09-10 | 0 |
| 2010-09-13 | 0 |
| 2010-09-14 | 0 |
| 2010-09-15 | 0 |
| 2010-09-16 | 0 |
| 2010-09-17 | 0 |
| 2010-09-20 | 0 |
| 2010-09-21 | 0 |
| 2010-09-22 | 0 |
| 2010-09-23 | 0 |
| 2010-09-24 | 0 |
| 2010-09-27 | 0 |
| 2010-09-28 | 0 |
| 2010-09-29 | 0 |
| 2010-09-30 | 0 |
| 2010-10-01 | 0 |
| 2010-10-04 | 0 |
| 2010-10-05 | 0 |
| 2010-10-06 | 0 |
| 2010-10-07 | 0 |
| 2010-10-08 | 0 |
| 2010-10-12 | 0 |
| 2010-10-13 | 0 |
| 2010-10-14 | 0 |
| 2010-10-15 | 0 |
| 2010-10-18 | 0 |
| 2010-10-19 | 0 |
| 2010-10-21 | 0 |
| 2010-10-25 | 0 |
| 2010-10-26 | 0 |
| 2010-10-27 | 0 |
| 2010-10-29 | 0 |
| 2010-11-01 | 0 |
| 2010-11-02 | 0 |
| 2010-11-03 | 0 |
| 2010-11-04 | 0 |
| 2010-11-05 | 0 |
| 2010-11-08 | 0 |
| 2010-11-09 | 0 |
| 2010-11-10 | 0 |
| 2010-11-11 | 0 |
| 2010-11-12 | 0 |
| 2010-11-15 | 0 |
| 2010-11-16 | 0 |
| 2010-11-17 | 0 |
| 2010-11-18 | 0 |
| 2010-11-19 | 0 |
| 2010-11-23 | -0.001 |
| 2010-11-26 | -0.001 |
| 2010-11-29 | 0 |
| 2010-11-30 | 0 |
| 2010-12-01 | 0 |
| 2010-12-03 | 0 |
| 2010-12-06 | 0 |
| 2010-12-07 | 0 |
| 2010-12-08 | 0 |
| 2010-12-09 | -0.001 |
| 2010-12-10 | -0.001 |
| 2010-12-13 | -0.001 |
| 2010-12-14 | -0.001 |
| 2010-12-15 | -0.001 |
| 2010-12-16 | 0 |
| 2010-12-17 | 0 |
| 2010-12-20 | 0 |
| 2010-12-21 | 0 |
| 2010-12-22 | 0 |
| 2010-12-23 | 0 |
| 2010-12-27 | 0 |
| 2010-12-28 | 0 |
| 2010-12-29 | -0.001 |
| 2010-12-31 | 0 |
| 2011-01-03 | -0.001 |
| 2011-01-04 | -0.001 |
| 2011-01-05 | -0.001 |
| 2011-01-06 | -0.001 |
| 2011-01-07 | -0.001 |
| 2011-01-10 | 0 |
| 2011-01-11 | 0 |
| 2011-01-12 | 0 |
| 2011-01-13 | 0 |
| 2011-01-14 | 0 |
| 2011-01-18 | 0 |
| 2011-01-19 | 0 |
| 2011-01-20 | 0 |
| 2011-01-21 | -0.001 |
| 2011-01-24 | -0.001 |
| 2011-01-25 | 0 |
| 2011-01-26 | -0.001 |
| 2011-01-28 | 0 |
| 2011-01-31 | 0 |
| 2011-02-02 | 0 |
| 2011-02-03 | 0 |
| 2011-02-04 | -0.001 |
| 2011-02-07 | -0.001 |
| 2011-02-08 | -0.001 |
| 2011-02-11 | -0.001 |
| 2011-02-14 | 0 |
| 2011-02-15 | 0 |
| 2011-02-16 | 0 |
| 2011-02-17 | 0 |
| 2011-02-18 | 0 |
| 2011-02-22 | 0 |
| 2011-02-23 | 0 |
| 2011-02-24 | 0 |
| 2011-02-25 | 0 |
| 2011-02-28 | 0 |
| 2011-03-01 | 0 |
| 2011-03-02 | 0 |
| 2011-03-03 | 0 |
| 2011-03-04 | -0.001 |
| 2011-03-07 | 0 |
| 2011-03-08 | 0 |
| 2011-03-09 | -0.001 |
| 2011-03-10 | 0 |
| 2011-03-11 | 0 |
| 2011-03-15 | 0 |
| 2011-03-16 | -0.001 |
| 2011-03-18 | -0.001 |
| 2011-03-21 | 0 |
| 2011-03-22 | 0 |
| 2011-03-23 | 0 |
| 2011-03-24 | 0 |
| 2011-03-25 | 0 |
| 2011-03-28 | 0 |
| 2011-03-29 | 0 |
| 2011-03-30 | 0 |
| 2011-03-31 | 0 |
| 2011-04-01 | 0 |
| 2011-04-04 | 0 |
| 2011-04-05 | 0 |
| 2011-04-06 | 0 |
| 2011-04-07 | 0 |
| 2011-04-08 | 0 |
| 2011-04-12 | 0 |
| 2011-04-13 | 0 |
| 2011-04-14 | 0 |
| 2011-04-15 | 0 |
| 2011-04-18 | 0 |
| 2011-04-19 | 0 |
| 2011-04-20 | 0 |
| 2011-04-21 | 0 |
| 2011-04-25 | 0 |
| 2011-04-26 | 0 |
| 2011-04-27 | 0 |
| 2011-04-28 | 0 |
| 2011-05-02 | 0 |
| 2011-05-04 | 0 |
| 2011-05-05 | 0 |
| 2011-05-06 | 0 |
| 2011-05-09 | 0 |
| 2011-05-10 | 0 |
| 2011-05-11 | 0 |
| 2011-05-13 | 0 |
| 2011-05-16 | 0 |
| 2011-05-17 | 0 |
| 2011-05-18 | 0 |
| 2011-05-19 | 0 |
| 2011-05-20 | 0 |
| 2011-05-23 | 0 |
| 2011-05-24 | 0 |
| 2011-05-25 | 0 |
| 2011-05-26 | 0 |
| 2011-05-31 | 0 |
| 2011-06-01 | 0 |
| 2011-06-02 | 0 |
| 2011-06-03 | 0 |
| 2011-06-06 | 0 |
| 2011-06-07 | 0 |
| 2011-06-08 | 0 |
| 2011-06-09 | 0 |
| 2011-06-10 | 0 |
| 2011-06-13 | 0 |
| 2011-06-14 | 0 |
| 2011-06-15 | 0 |
| 2011-06-16 | 0 |
| 2011-06-17 | 0 |
| 2011-06-20 | 0 |
| 2011-06-21 | 0 |
| 2011-06-23 | 0 |
| 2011-06-24 | 0 |
| 2011-06-27 | 0 |
| 2011-06-28 | 0 |
| 2011-06-29 | 0 |
| 2011-07-05 | 0 |
| 2011-07-06 | 0 |
| 2011-07-07 | 0 |
| 2011-07-08 | 0 |
| 2011-07-12 | 0 |
| 2011-07-13 | 0 |
| 2011-07-14 | 0 |
| 2011-07-15 | 0 |
| 2011-07-18 | 0 |
| 2011-07-19 | 0 |
| 2011-07-20 | 0 |
| 2011-07-21 | 0 |
| 2011-07-22 | 0 |
| 2011-07-25 | 0 |
| 2011-07-26 | 0 |
| 2011-07-27 | 0 |
| 2011-07-28 | 0 |
| 2011-07-29 | 0 |
| 2011-08-01 | 0 |
| 2011-08-02 | 0 |
| 2011-08-03 | 0 |
| 2011-08-04 | 0 |
| 2011-08-05 | 0 |
| 2011-08-08 | 0.001 |
| 2011-08-09 | 0.001 |
| 2011-08-10 | 0.001 |
| 2011-08-11 | 0.001 |
| 2011-08-12 | 0.001 |
| 2011-08-15 | 0.001 |
| 2011-08-16 | 0.001 |
| 2011-08-17 | 0.001 |
| 2011-08-18 | 0.001 |
| 2011-08-19 | 0.001 |
| 2011-08-22 | 0.001 |
| 2011-08-23 | 0.001 |
| 2011-08-24 | 0.001 |
| 2011-08-25 | 0.001 |
| 2011-08-26 | 0.001 |
| 2011-08-29 | 0.001 |
| 2011-08-30 | 0.001 |
| 2011-08-31 | 0.001 |
| 2011-09-01 | 0.001 |
| 2011-09-02 | 0.001 |
| 2011-09-06 | 0.001 |
| 2011-09-07 | 0.001 |
| 2011-09-09 | 0.001 |
| 2011-09-12 | 0.001 |
| 2011-09-13 | 0.001 |
| 2011-09-14 | 0.001 |
| 2011-09-15 | 0.001 |
| 2011-09-16 | 0.001 |
| 2011-09-19 | 0.001 |
| 2011-09-21 | 0.001 |
| 2011-09-22 | 0.001 |
| 2011-09-23 | 0.001 |
| 2011-09-27 | 0 |
| 2011-09-28 | 0.001 |
| 2011-09-30 | 0.001 |
| 2011-10-03 | 0.001 |
| 2011-10-04 | 0.001 |
| 2011-10-05 | 0.001 |
| 2011-10-06 | 0 |
| 2011-10-07 | 0.001 |
| 2011-10-11 | 0.001 |
| 2011-10-12 | 0 |
| 2011-10-13 | 0 |
| 2011-10-14 | 0 |
| 2011-10-17 | 0 |
| 2011-10-18 | 0 |
| 2011-10-19 | 0 |
| 2011-10-21 | 0 |
| 2011-10-24 | 0 |
| 2011-10-25 | 0 |
| 2011-10-26 | 0 |
| 2011-10-27 | 0 |
| 2011-11-09 | 0.001 |
| 2011-11-10 | 0.001 |
| 2011-11-14 | 0.001 |
| 2011-11-15 | 0.001 |
| 2011-11-16 | 0.001 |
| 2011-11-17 | 0.001 |
| 2011-11-21 | 0.001 |
| 2011-11-22 | 0.001 |
| 2011-11-25 | 0.001 |
| 2011-11-28 | 0.002 |
| 2011-11-29 | 0.001 |
| 2011-11-30 | 0.001 |
| 2011-12-01 | 0.001 |
| 2011-12-02 | 0.001 |
| 2011-12-05 | 0.001 |
| 2011-12-06 | 0.001 |
| 2011-12-08 | 0.001 |
| 2011-12-09 | 0.001 |
| 2011-12-12 | 0.001 |
| 2011-12-14 | 0.001 |
| 2011-12-15 | 0.001 |
| 2011-12-16 | 0.001 |
| 2011-12-19 | 0.001 |
| 2011-12-20 | 0.001 |
| 2011-12-21 | 0.001 |
| 2011-12-23 | 0 |
| 2011-12-27 | 0.001 |
| 2011-12-28 | 0 |
| 2011-12-30 | 0.001 |
| 2012-01-03 | 0 |
| 2012-01-04 | 0.001 |
| 2012-01-05 | 0.001 |
| 2012-01-06 | 0 |
| 2012-01-10 | 0 |
| 2012-01-11 | 0.001 |
| 2012-01-12 | 0.001 |
| 2012-01-13 | 0 |
| 2012-01-17 | 0.001 |
| 2012-01-18 | 0.001 |
| 2012-01-19 | 0.001 |
| 2012-01-20 | 0.001 |
| 2012-01-23 | 0.001 |
| 2012-01-25 | 0.001 |
| 2012-01-26 | 0.001 |
| 2012-01-27 | 0.001 |
| 2012-01-31 | 0 |
| 2012-02-01 | 0.001 |
| 2012-02-03 | 0 |
| 2012-02-06 | 0 |
| 2012-02-07 | 0 |
| 2012-02-08 | 0 |
| 2012-02-09 | 0 |
| 2012-02-10 | 0 |
| 2012-02-14 | 0 |
| 2012-02-15 | 0 |
| 2012-02-16 | 0 |
| 2012-02-17 | 0 |
| 2012-02-21 | 0 |
| 2012-02-22 | 0 |
| 2012-02-23 | 0 |
| 2012-02-24 | 0 |
| 2012-02-27 | 0 |
| 2012-02-28 | 0 |
| 2012-03-01 | 0 |
| 2012-03-02 | 0 |
| 2012-03-05 | 0 |
| 2012-03-07 | 0 |
| 2012-03-08 | 0 |
| 2012-03-09 | 0 |
| 2012-03-12 | 0 |
| 2012-03-14 | 0 |
| 2012-03-15 | 0 |
| 2012-03-19 | 0 |
| 2012-03-20 | 0 |
| 2012-03-21 | 0 |
| 2012-03-22 | 0 |
| 2012-03-23 | 0 |
| 2012-03-26 | 0 |
| 2012-03-27 | 0 |
| 2012-03-28 | 0 |
| 2012-03-29 | 0 |
| 2012-03-30 | 0 |
| 2012-04-02 | 0 |
| 2012-04-03 | 0 |
| 2012-04-04 | 0 |
| 2012-04-05 | 0 |
| 2012-04-06 | 0 |
| 2012-04-09 | 0 |
| 2012-04-10 | 0 |
| 2012-04-11 | 0 |
| 2012-04-12 | 0 |
| 2012-04-13 | 0 |
| 2012-04-16 | 0 |
| 2012-04-17 | 0 |
| 2012-04-18 | 0 |
| 2012-04-19 | 0 |
| 2012-04-20 | 0 |
| 2012-04-23 | 0.001 |
| 2012-04-24 | 0.001 |
| 2012-04-25 | 0.001 |
| 2012-04-26 | 0.001 |
| 2012-04-27 | 0.001 |
| 2012-04-30 | 0.001 |
| 2012-05-01 | 0.001 |
| 2012-05-02 | 0.001 |
| 2012-05-03 | 0.001 |
| 2012-05-04 | 0.001 |
| 2012-05-07 | 0.001 |
| 2012-05-08 | 0.001 |
| 2012-05-09 | 0.001 |
| 2012-05-10 | 0.001 |
| 2012-05-11 | 0.001 |
| 2012-05-14 | 0.001 |
| 2012-05-15 | 0.001 |
| 2012-05-16 | 0.001 |
| 2012-05-17 | 0.001 |
| 2012-05-18 | 0.001 |
| 2012-05-21 | 0.001 |
| 2012-05-22 | 0.001 |
| 2012-05-23 | 0.001 |
| 2012-05-24 | 0.001 |
| 2012-05-25 | 0.001 |
| 2012-05-29 | 0.001 |
| 2012-05-31 | 0.001 |
| 2012-06-01 | 0.001 |
| 2012-06-04 | 0.001 |
| 2012-06-05 | 0.001 |
| 2012-06-06 | 0.001 |
| 2012-06-07 | 0.001 |
| 2012-06-08 | 0.001 |
| 2012-06-11 | 0.001 |
| 2012-06-12 | 0.001 |
| 2012-06-13 | 0.001 |
| 2012-06-14 | 0.001 |
| 2012-06-15 | 0.001 |
| 2012-06-18 | 0.001 |
| 2012-06-19 | 0.001 |
| 2012-06-21 | 0 |
| 2012-06-22 | 0 |
| 2012-06-25 | 0 |
| 2012-06-26 | 0 |
| 2012-06-27 | 0 |
| 2012-06-28 | 0 |
| 2012-06-29 | 0 |
| 2012-07-02 | 0 |
| 2012-07-03 | 0 |
| 2012-07-05 | 0 |
| 2012-07-06 | 0 |
| 2012-07-09 | 0 |
| 2012-07-10 | 0 |
| 2012-07-11 | 0 |
| 2012-07-12 | 0 |
| 2012-07-13 | 0 |
| 2012-07-16 | 0 |
| 2012-07-17 | 0 |
| 2012-07-18 | 0 |
| 2012-07-19 | 0 |
| 2012-07-20 | 0 |
| 2012-07-23 | 0 |
| 2012-07-24 | 0 |
| 2012-07-25 | 0 |
| 2012-07-27 | 0 |
| 2012-07-30 | 0 |
| 2012-07-31 | 0 |
| 2012-08-01 | 0 |
| 2012-08-03 | 0 |
| 2012-08-06 | 0 |
| 2012-08-08 | 0 |
| 2012-08-09 | 0 |
| 2012-08-10 | 0 |
| 2012-08-13 | 0 |
| 2012-08-15 | 0 |
| 2012-08-16 | 0 |
| 2012-08-17 | 0 |
| 2012-08-20 | 0 |
| 2012-08-21 | 0 |
| 2012-08-22 | 0 |
| 2012-08-23 | 0 |
| 2012-08-24 | 0 |
| 2012-08-27 | 0 |
| 2012-08-28 | 0 |
| 2012-08-29 | 0 |
| 2012-08-30 | 0 |
| 2012-08-31 | 0 |
| 2012-09-04 | 0 |
| 2012-09-05 | 0 |
| 2012-09-06 | 0 |
| 2012-09-07 | 0 |
| 2012-09-10 | 0 |
| 2012-09-11 | 0 |
| 2012-09-12 | 0 |
| 2012-09-13 | 0 |
| 2012-09-17 | 0 |
| 2012-09-18 | 0 |
| 2012-09-19 | 0 |
| 2012-09-20 | 0 |
| 2012-09-21 | 0 |
| 2012-09-24 | 0 |
| 2012-09-25 | 0 |
| 2012-09-26 | 0 |
| 2012-09-27 | 0 |
| 2012-09-28 | 0 |
| 2012-10-01 | 0 |
| 2012-10-02 | 0 |
| 2012-10-03 | 0 |
| 2012-10-04 | 0 |
| 2012-10-05 | 0 |
| 2012-10-09 | 0 |
| 2012-10-10 | 0 |
| 2012-10-11 | 0 |
| 2012-10-12 | 0 |
| 2012-10-15 | 0 |
| 2012-10-16 | 0 |
| 2012-10-17 | 0 |
| 2012-10-18 | 0 |
| 2012-10-19 | 0 |
| 2012-10-22 | 0 |
| 2012-10-23 | 0 |
| 2012-10-24 | 0 |
| 2012-10-25 | 0 |
| 2012-11-02 | 0 |
| 2012-11-05 | 0 |
| 2012-11-06 | 0 |
| 2012-11-07 | 0 |
| 2012-11-08 | 0 |
| 2012-11-09 | 0 |
| 2012-11-13 | 0 |
| 2012-11-14 | 0 |
| 2012-11-15 | 0.001 |
| 2012-11-16 | 0.001 |
| 2012-11-19 | 0 |
| 2012-11-20 | 0 |
| 2012-11-23 | 0 |
| 2012-11-26 | 0 |
| 2012-11-27 | 0 |
| 2012-11-28 | 0 |
| 2012-11-29 | 0 |
| 2012-11-30 | 0 |
| 2012-12-03 | 0 |
| 2012-12-04 | 0 |
| 2012-12-05 | 0 |
| 2012-12-06 | 0 |
| 2012-12-07 | 0 |
| 2012-12-10 | 0 |
| 2012-12-11 | 0 |
| 2012-12-12 | 0 |
| 2012-12-13 | 0 |
| 2012-12-14 | 0 |
| 2012-12-17 | 0 |
| 2012-12-18 | 0 |
| 2012-12-19 | 0 |
| 2012-12-20 | 0 |
| 2012-12-24 | 0 |
| 2012-12-26 | 0 |
| 2012-12-27 | 0 |
| 2012-12-31 | 0 |
| 2013-01-02 | 0 |
| 2013-01-03 | 0 |
| 2013-01-04 | 0 |
| 2013-01-07 | 0 |
| 2013-01-08 | 0 |
| 2013-01-09 | 0 |
| 2013-01-10 | 0 |
| 2013-01-11 | 0 |
| 2013-01-14 | 0 |
| 2013-01-15 | 0 |
| 2013-01-16 | 0 |
| 2013-01-17 | 0 |
| 2013-01-18 | 0 |
| 2013-01-22 | 0 |
| 2013-01-23 | 0 |
| 2013-01-24 | 0 |
| 2013-01-25 | 0 |
| 2013-01-28 | 0 |
| 2013-01-29 | 0 |
| 2013-01-30 | 0 |
| 2013-01-31 | 0 |
| 2013-02-01 | 0 |
| 2013-02-04 | 0 |
| 2013-02-05 | 0 |
| 2013-02-06 | 0 |
| 2013-02-07 | 0 |
| 2013-02-08 | 0 |
| 2013-02-11 | 0 |
| 2013-02-12 | 0 |
| 2013-02-13 | 0 |
| 2013-02-14 | 0 |
| 2013-02-15 | 0 |
| 2013-02-19 | 0 |
| 2013-02-20 | 0 |
| 2013-02-21 | 0 |
| 2013-02-22 | 0 |
| 2013-02-25 | 0 |
| 2013-02-26 | 0 |
| 2013-02-27 | 0 |
| 2013-02-28 | 0 |
| 2013-03-01 | 0 |
| 2013-03-04 | 0 |
| 2013-03-05 | 0 |
| 2013-03-06 | 0 |
| 2013-03-07 | 0 |
| 2013-03-08 | 0 |
| 2013-03-11 | 0 |
| 2013-03-12 | 0 |
| 2013-03-13 | 0 |
| 2013-03-14 | 0 |
| 2013-03-15 | 0 |
| 2013-03-18 | 0 |
| 2013-03-19 | 0 |
| 2013-03-20 | 0 |
| 2013-03-21 | 0 |
| 2013-03-22 | 0 |
| 2013-03-25 | 0 |
| 2013-03-27 | 0 |
| 2013-03-28 | 0 |
| 2013-04-01 | 0 |
| 2013-04-02 | 0 |
| 2013-04-03 | 0 |
| 2013-04-04 | 0 |
| 2013-04-05 | 0 |
| 2013-04-08 | 0 |
| 2013-04-10 | 0 |
| 2013-04-15 | 0 |
| 2013-04-16 | 0 |
| 2013-04-17 | 0 |
| 2013-04-18 | 0 |
| 2013-04-19 | 0 |
| 2013-04-22 | 0 |
| 2013-04-23 | 0 |
| 2013-04-24 | 0 |
| 2013-04-25 | 0 |
| 2013-04-26 | 0 |
| 2013-04-29 | 0 |
| 2013-04-30 | 0 |
| 2013-05-01 | 0 |
| 2013-05-02 | 0 |
| 2013-05-03 | 0 |
| 2013-05-06 | 0 |
| 2013-05-07 | 0 |
| 2013-05-08 | 0 |
| 2013-05-09 | 0 |
| 2013-05-10 | 0 |
| 2013-05-13 | 0 |
| 2013-05-14 | 0 |
| 2013-05-15 | 0 |
| 2013-05-16 | 0 |
| 2013-05-17 | 0 |
| 2013-05-20 | 0 |
| 2013-05-21 | 0 |
| 2013-05-22 | 0 |
| 2013-05-23 | 0 |
| 2013-05-24 | 0 |
| 2013-05-29 | 0 |
| 2013-05-30 | 0 |
| 2013-05-31 | 0 |
| 2013-06-03 | 0 |
| 2013-06-04 | 0 |
| 2013-06-05 | 0 |
| 2013-06-06 | 0 |
| 2013-06-07 | 0 |
| 2013-06-10 | 0 |
| 2013-06-11 | 0 |
| 2013-06-12 | 0 |
| 2013-06-13 | 0 |
| 2013-06-14 | 0 |
| 2013-06-17 | 0 |
| 2013-06-18 | 0 |
| 2013-06-19 | 0 |
| 2013-06-21 | 0 |
| 2013-06-24 | 0 |
| 2013-06-25 | 0 |
| 2013-06-26 | 0 |
| 2013-06-27 | 0 |
| 2013-06-28 | 0 |
| 2013-07-01 | 0 |
| 2013-07-02 | 0 |
| 2013-07-05 | 0 |
| 2013-07-08 | 0 |
| 2013-07-09 | 0 |
| 2013-07-10 | 0 |
| 2013-07-11 | 0 |
| 2013-07-12 | 0 |
| 2013-07-15 | 0 |
| 2013-07-16 | 0 |
| 2013-07-17 | 0 |
| 2013-07-18 | 0 |
| 2013-07-19 | 0 |
| 2013-07-22 | 0 |
| 2013-07-23 | 0 |
| 2013-07-24 | 0 |
| 2013-07-25 | 0 |
| 2013-07-26 | 0 |
| 2013-07-29 | 0 |
| 2013-07-30 | 0 |
| 2013-07-31 | 0 |
| 2013-08-01 | 0 |
| 2013-08-02 | 0 |
| 2013-08-05 | 0.001 |
| 2013-08-06 | 0.001 |
| 2013-08-07 | 0.001 |
| 2013-08-08 | 0.001 |
| 2013-08-09 | 0.001 |
| 2013-08-12 | 0.001 |
| 2013-08-13 | 0.001 |
| 2013-08-14 | 0.001 |
| 2013-08-15 | 0.001 |
| 2013-08-16 | 0.001 |
| 2013-08-19 | 0.001 |
| 2013-08-20 | 0.001 |
| 2013-08-21 | 0.001 |
| 2013-08-22 | 0.001 |
| 2013-08-23 | 0.001 |
| 2013-08-26 | 0.001 |
| 2013-08-27 | 0.001 |
| 2013-08-28 | 0.001 |
| 2013-08-29 | 0.001 |
| 2013-08-30 | 0.001 |
| 2013-09-04 | 0.001 |
| 2013-09-05 | 0.001 |
| 2013-09-06 | 0.001 |
| 2013-09-09 | 0.001 |
| 2013-09-10 | 0.001 |
| 2013-09-11 | 0.001 |
| 2013-09-12 | 0.001 |
| 2013-09-13 | 0.001 |
| 2013-09-16 | 0.001 |
| 2013-09-17 | 0 |
| 2013-09-18 | 0 |
| 2013-09-19 | 0 |
| 2013-09-20 | 0 |
| 2013-09-23 | 0 |
| 2013-09-24 | 0 |
| 2013-09-25 | 0 |
| 2013-09-26 | 0 |
| 2013-09-27 | 0 |
| 2013-09-30 | 0 |
| 2013-10-01 | 0 |
| 2013-10-02 | 0 |
| 2013-10-03 | 0 |
| 2013-10-04 | 0 |
| 2013-10-07 | 0 |
| 2013-10-08 | 0 |
| 2013-10-09 | 0 |
| 2013-10-10 | 0 |
| 2013-10-11 | 0 |
| 2013-10-15 | 0 |
| 2013-10-16 | 0 |
| 2013-10-17 | 0 |
| 2013-10-18 | 0 |
| 2013-10-21 | 0 |
| 2013-10-22 | 0 |
| 2013-10-23 | 0 |
| 2013-10-24 | 0 |
| 2013-10-25 | 0 |
| 2013-10-28 | 0 |
| 2013-10-29 | 0 |
| 2013-10-30 | 0 |
| 2013-10-31 | 0 |
| 2013-11-01 | 0 |
| 2013-11-04 | 0 |
| 2013-11-05 | 0 |
| 2013-11-06 | 0 |
| 2013-11-07 | 0 |
| 2013-11-08 | 0 |
| 2013-11-12 | 0 |
| 2013-11-13 | 0 |
| 2013-11-14 | 0 |
| 2013-11-15 | 0.001 |
| 2013-11-18 | 0 |
| 2013-11-19 | 0 |
| 2013-11-20 | 0 |
| 2013-11-21 | 0 |
| 2013-11-22 | 0 |
| 2013-11-26 | 0.001 |
| 2013-11-29 | 0 |
| 2013-12-02 | 0 |
| 2013-12-03 | 0.001 |
| 2013-12-04 | 0.001 |
| 2013-12-05 | 0 |
| 2013-12-06 | 0 |
| 2013-12-09 | 0 |
| 2013-12-10 | 0 |
| 2013-12-11 | 0 |
| 2013-12-12 | 0.001 |
| 2013-12-13 | 0 |
| 2013-12-16 | 0.001 |
| 2013-12-17 | 0.001 |
| 2013-12-18 | 0.001 |
| 2013-12-19 | 0 |
| 2013-12-20 | 0 |
| 2013-12-23 | 0 |
| 2013-12-24 | 0 |
| 2013-12-26 | 0 |
| 2013-12-31 | 0 |
| 2014-01-02 | 0 |
| 2014-01-03 | 0 |
| 2014-01-06 | 0 |
| 2014-01-07 | 0 |
| 2014-01-08 | 0 |
| 2014-01-09 | 0 |
| 2014-01-10 | 0.001 |
| 2014-01-13 | 0.001 |
| 2014-01-14 | 0.001 |
| 2014-01-15 | 0.001 |
| 2014-01-16 | 0.001 |
| 2014-01-17 | 0.001 |
| 2014-01-21 | 0.001 |
| 2014-01-22 | 0.001 |
| 2014-01-23 | 0.001 |
| 2014-01-24 | 0.001 |
| 2014-01-28 | 0.001 |
| 2014-01-29 | 0.001 |
| 2014-01-30 | 0.001 |
| 2014-01-31 | 0.001 |
| 2014-02-03 | 0.001 |
| 2014-02-04 | 0.001 |
| 2014-02-05 | 0.001 |
| 2014-02-06 | 0.001 |
| 2014-02-07 | 0.001 |
| 2014-02-10 | 0.001 |
| 2014-02-11 | 0.001 |
| 2014-02-12 | 0.001 |
| 2014-02-13 | 0.001 |
| 2014-02-14 | 0.001 |
| 2014-02-18 | 0.001 |
| 2014-02-20 | 0.001 |
| 2014-02-21 | 0.001 |
| 2014-02-24 | 0.001 |
| 2014-02-25 | 0.001 |
| 2014-02-26 | 0.001 |
| 2014-02-27 | 0.001 |
| 2014-02-28 | 0.001 |
| 2014-03-03 | 0.001 |
| 2014-03-04 | 0.001 |
| 2014-03-05 | 0.001 |
| 2014-03-06 | 0.001 |
| 2014-03-07 | 0.001 |
| 2014-03-10 | 0.001 |
| 2014-03-11 | 0.001 |
| 2014-03-12 | 0.001 |
| 2014-03-13 | 0.001 |
| 2014-03-14 | 0.001 |
| 2014-03-17 | 0.001 |
| 2014-03-18 | 0.001 |
| 2014-03-19 | 0.001 |
| 2014-03-20 | 0 |
| 2014-03-21 | 0 |
| 2014-03-24 | 0 |
| 2014-03-25 | 0 |
| 2014-03-26 | 0 |
| 2014-03-27 | 0 |
| 2014-03-28 | 0 |
| 2014-03-31 | 0 |
| 2014-04-01 | 0 |
| 2014-04-02 | 0 |
| 2014-04-03 | 0 |
| 2014-04-04 | 0 |
| 2014-04-07 | 0 |
| 2014-04-08 | 0 |
| 2014-04-09 | 0 |
| 2014-04-10 | 0 |
| 2014-04-11 | 0 |
| 2014-04-14 | 0 |
| 2014-04-15 | 0 |
| 2014-04-16 | 0 |
| 2014-04-17 | 0 |
| 2014-04-21 | 0 |
| 2014-04-22 | 0 |
| 2014-04-23 | 0 |
| 2014-04-24 | 0 |
| 2014-04-25 | 0 |
| 2014-04-28 | 0 |
| 2014-04-30 | 0 |
| 2014-05-01 | 0.001 |
| 2014-05-02 | 0.001 |
| 2014-05-05 | 0.001 |
| 2014-05-06 | 0 |
| 2014-05-07 | 0.001 |
| 2014-05-08 | 0.001 |
| 2014-05-09 | 0.001 |
| 2014-05-12 | 0.001 |
| 2014-05-14 | 0.001 |
| 2014-05-15 | 0.001 |
| 2014-05-16 | 0.001 |
| 2014-05-19 | 0 |
| 2014-05-20 | 0.001 |
| 2014-05-21 | 0.001 |
| 2014-05-22 | 0.001 |
| 2014-05-23 | 0.001 |
| 2014-05-27 | 0.001 |
| 2014-05-28 | 0.001 |
| 2014-05-29 | 0.001 |
| 2014-05-30 | 0.001 |
| 2014-06-02 | 0.001 |
| 2014-06-03 | 0.001 |
| 2014-06-04 | 0.001 |
| 2014-06-05 | 0.001 |
| 2014-06-06 | 0.001 |
| 2014-06-09 | 0.001 |
| 2014-06-10 | 0.001 |
| 2014-06-11 | 0.001 |
| 2014-06-12 | 0.001 |
| 2014-06-13 | 0.001 |
| 2014-06-16 | 0.001 |
| 2014-06-17 | 0.001 |
| 2014-06-18 | 0.001 |
| 2014-06-19 | 0.001 |
| 2014-06-20 | 0.001 |
| 2014-06-23 | 0.001 |
| 2014-06-24 | 0.001 |
| 2014-06-25 | 0.001 |
| 2014-06-26 | 0.001 |
| 2014-06-27 | 0.001 |
| 2014-06-30 | 0.001 |
| 2014-07-01 | 0.001 |
| 2014-07-02 | 0.001 |
| 2014-07-03 | 0 |
| 2014-07-07 | 0.001 |
| 2014-07-08 | 0.001 |
| 2014-07-09 | 0 |
| 2014-07-10 | 0.001 |
| 2014-07-11 | 0.001 |
| 2014-07-14 | 0.001 |
| 2014-07-15 | 0.001 |
| 2014-07-16 | 0.001 |
| 2014-07-17 | 0.001 |
| 2014-07-18 | 0.001 |
| 2014-07-21 | 0.001 |
| 2014-07-22 | 0.001 |
| 2014-07-23 | 0.001 |
| 2014-07-24 | 0.001 |
| 2014-07-25 | 0.001 |
| 2014-07-28 | 0.001 |
| 2014-07-29 | 0.001 |
| 2014-07-30 | 0.001 |
| 2014-07-31 | 0.001 |
| 2014-08-01 | 0.001 |
| 2014-08-04 | 0.001 |
| 2014-08-05 | 0.001 |
| 2014-08-06 | 0.001 |
| 2014-08-07 | 0.001 |
| 2014-08-08 | 0.001 |
| 2014-08-11 | 0.001 |
| 2014-08-12 | 0.001 |
| 2014-08-13 | 0.001 |
| 2014-08-14 | 0.001 |
| 2014-08-15 | 0.001 |
| 2014-08-18 | 0.001 |
| 2014-08-19 | 0.001 |
| 2014-08-20 | 0.001 |
| 2014-08-21 | 0.001 |
| 2014-08-22 | 0.001 |
| 2014-08-25 | 0.001 |
| 2014-08-26 | 0.001 |
| 2014-08-27 | 0.001 |
| 2014-08-28 | 0.001 |
| 2014-08-29 | 0 |
| 2014-09-02 | 0.001 |
| 2014-09-03 | 0.001 |
| 2014-09-04 | 0 |
| 2014-09-05 | 0.001 |
| 2014-09-08 | 0.001 |
| 2014-09-09 | 0.001 |
| 2014-09-10 | 0 |
| 2014-09-11 | 0.001 |
| 2014-09-12 | 0.001 |
| 2014-09-15 | 0.001 |
| 2014-09-16 | 0.001 |
| 2014-09-17 | 0.001 |
| 2014-09-18 | 0.001 |
| 2014-09-19 | 0.001 |
| 2014-09-22 | 0.001 |
| 2014-09-23 | 0.001 |
| 2014-09-24 | 0.001 |
| 2014-09-25 | 0.001 |
| 2014-09-26 | 0.001 |
| 2014-09-29 | 0.001 |
| 2014-09-30 | 0.001 |
| 2014-10-01 | 0.001 |
| 2014-10-02 | 0.001 |
| 2014-10-03 | 0.001 |
| 2014-10-06 | 0.001 |
| 2014-10-07 | 0.001 |
| 2014-10-08 | 0.001 |
| 2014-10-09 | 0.001 |
| 2014-10-10 | 0.001 |
| 2014-10-14 | 0.001 |
| 2014-10-15 | 0.001 |
| 2014-10-16 | 0.001 |
| 2014-10-17 | 0.001 |
| 2014-10-20 | 0.001 |
| 2014-10-21 | 0.001 |
| 2014-10-22 | 0.001 |
| 2014-10-23 | 0.001 |
| 2014-10-24 | 0.001 |
| 2014-10-27 | 0.001 |
| 2014-10-28 | 0.001 |
| 2014-10-29 | 0.001 |
| 2014-10-30 | 0.001 |
| 2014-10-31 | 0.001 |
| 2014-11-03 | 0.001 |
| 2014-11-04 | 0.001 |
| 2014-11-05 | 0.001 |
| 2014-11-06 | 0.001 |
| 2014-11-07 | 0.001 |
| 2014-11-10 | 0.001 |
| 2014-11-12 | 0.001 |
| 2014-11-13 | 0.001 |
| 2014-11-14 | 0.001 |
| 2014-11-17 | 0.001 |
| 2014-11-18 | 0.001 |
| 2014-11-19 | 0.001 |
| 2014-11-20 | 0.001 |
| 2014-11-21 | 0.001 |
| 2014-11-24 | 0.001 |
| 2014-11-25 | 0.001 |
| 2014-11-28 | 0.001 |
| 2014-12-01 | 0.001 |
| 2014-12-02 | 0.001 |
| 2014-12-03 | 0.001 |
| 2014-12-04 | 0.001 |
| 2014-12-05 | 0.001 |
| 2014-12-08 | 0.001 |
| 2014-12-09 | 0.001 |
| 2014-12-10 | 0.001 |
| 2014-12-11 | 0.001 |
| 2014-12-12 | 0.001 |
| 2014-12-15 | 0.001 |
| 2014-12-16 | 0.001 |
| 2014-12-17 | 0.001 |
| 2014-12-18 | 0.001 |
| 2014-12-19 | 0.001 |
| 2014-12-22 | 0.001 |
| 2014-12-23 | 0.001 |
| 2014-12-26 | 0.001 |
| 2014-12-29 | 0.001 |
| 2014-12-30 | 0.001 |
| 2015-01-02 | 0.001 |
| 2015-01-05 | 0.001 |
| 2015-01-06 | 0.001 |
| 2015-01-07 | 0.001 |
| 2015-01-08 | 0.001 |
| 2015-01-09 | 0.001 |
| 2015-01-12 | 0.001 |
| 2015-01-13 | 0.001 |
| 2015-01-14 | 0.001 |
| 2015-01-15 | 0.001 |
| 2015-01-16 | 0.001 |
| 2015-01-20 | 0.001 |
| 2015-01-21 | 0.001 |
| 2015-01-22 | 0.001 |
| 2015-01-23 | 0.001 |
| 2015-01-26 | 0.001 |
| 2015-01-27 | 0.001 |
| 2015-01-28 | 0.001 |
| 2015-01-29 | 0.001 |
| 2015-01-30 | 0.002 |
| 2015-02-02 | 0.001 |
| 2015-02-03 | 0.001 |
| 2015-02-04 | 0.002 |
| 2015-02-05 | 0.001 |
| 2015-02-06 | 0.001 |
| 2015-02-09 | 0.001 |
| 2015-02-10 | 0.001 |
| 2015-02-11 | 0.001 |
| 2015-02-12 | 0.001 |
| 2015-02-13 | 0.001 |
| 2015-02-17 | 0.001 |
| 2015-02-18 | 0.001 |
| 2015-02-19 | 0.001 |
| 2015-02-20 | 0.001 |
| 2015-02-23 | 0.001 |
| 2015-02-24 | 0.001 |
| 2015-02-25 | 0.001 |
| 2015-02-26 | 0.001 |
| 2015-02-27 | 0.001 |
| 2015-03-02 | 0.001 |
| 2015-03-03 | 0.001 |
| 2015-03-04 | 0.001 |
| 2015-03-05 | 0.001 |
| 2015-03-06 | 0.001 |
| 2015-03-09 | 0.001 |
| 2015-03-10 | 0.001 |
| 2015-03-11 | 0.001 |
| 2015-03-12 | 0.001 |
| 2015-03-13 | 0.001 |
| 2015-03-16 | 0.001 |
| 2015-03-17 | 0.001 |
| 2015-03-18 | 0.001 |
| 2015-03-19 | 0.001 |
| 2015-03-20 | 0.001 |
| 2015-03-23 | 0.001 |
| 2015-03-24 | 0.001 |
| 2015-03-25 | 0.001 |
| 2015-03-26 | 0.001 |
| 2015-03-27 | 0.001 |
| 2015-03-30 | 0.001 |
| 2015-03-31 | 0.001 |
| 2015-04-01 | 0.001 |
| 2015-04-02 | 0.001 |
| 2015-04-03 | 0.001 |
| 2015-04-06 | 0.001 |
| 2015-04-07 | 0.001 |
| 2015-04-08 | 0.001 |
| 2015-04-09 | 0.001 |
| 2015-04-10 | 0.001 |
| 2015-04-13 | 0.001 |
| 2015-04-14 | 0.001 |
| 2015-04-15 | 0.001 |
| 2015-04-16 | 0.001 |
| 2015-04-17 | 0.001 |
| 2015-04-20 | 0.001 |
| 2015-04-21 | 0.001 |
| 2015-04-22 | 0.001 |
| 2015-04-23 | 0.001 |
| 2015-04-24 | 0.001 |
| 2015-04-27 | 0.001 |
| 2015-04-28 | 0.001 |
| 2015-04-29 | 0.001 |
| 2015-04-30 | 0.001 |
| 2015-05-01 | 0.001 |
| 2015-05-04 | 0.001 |
| 2015-05-05 | 0.001 |
| 2015-05-06 | 0.001 |
| 2015-05-07 | 0.001 |
| 2015-05-08 | 0.001 |
| 2015-05-11 | 0.001 |
| 2015-05-12 | 0.001 |
| 2015-05-13 | 0.001 |
| 2015-05-14 | 0.001 |
| 2015-05-15 | 0.001 |
| 2015-05-18 | 0.001 |
| 2015-05-19 | 0.001 |
| 2015-05-20 | 0.001 |
| 2015-05-21 | 0.001 |
| 2015-05-22 | 0.001 |
| 2015-05-26 | 0.001 |
| 2015-05-27 | 0.001 |
| 2015-05-28 | 0.001 |
| 2015-05-29 | 0.001 |
| 2015-06-01 | 0.001 |
| 2015-06-02 | 0.001 |
| 2015-06-03 | 0.001 |
| 2015-06-04 | 0.001 |
| 2015-06-05 | 0.001 |
| 2015-06-08 | 0.001 |
| 2015-06-09 | 0.001 |
| 2015-06-10 | 0.001 |
| 2015-06-11 | 0.001 |
| 2015-06-12 | 0.001 |
| 2015-06-15 | 0.001 |
| 2015-06-16 | 0.001 |
| 2015-06-17 | 0.001 |
| 2015-06-18 | 0.001 |
| 2015-06-19 | 0.001 |
| 2015-06-22 | 0.001 |
| 2015-06-23 | 0.001 |
| 2015-06-24 | 0.001 |
| 2015-06-25 | 0.001 |
| 2015-06-26 | 0 |
| 2015-06-29 | 0.001 |
| 2015-06-30 | 0 |
| 2015-07-01 | 0 |
| 2015-07-02 | 0 |
| 2015-07-06 | 0 |
| 2015-07-07 | 0 |
| 2015-07-08 | 0 |
| 2015-07-09 | 0 |
| 2015-07-10 | 0 |
| 2015-07-13 | 0 |
| 2015-07-15 | 0.001 |
| 2015-07-16 | 0 |
| 2015-07-17 | 0.001 |
| 2015-07-20 | 0.001 |
| 2015-07-21 | 0.001 |
| 2015-07-22 | 0.001 |
| 2015-07-23 | 0.001 |
| 2015-07-24 | 0.001 |
| 2015-07-27 | 0.001 |
| 2015-07-28 | 0.001 |
| 2015-07-29 | 0.001 |
| 2015-07-30 | 0.001 |
| 2015-07-31 | 0.001 |
| 2015-08-03 | 0.001 |
| 2015-08-04 | 0.001 |
| 2015-08-05 | 0.001 |
| 2015-08-06 | 0.001 |
| 2015-08-07 | 0.001 |
| 2015-08-10 | 0.001 |
| 2015-08-11 | 0.001 |
| 2015-08-12 | 0.001 |
| 2015-08-13 | 0.001 |
| 2015-08-14 | 0.001 |
| 2015-08-17 | 0.001 |
| 2015-08-18 | 0.001 |
| 2015-08-19 | 0.001 |
| 2015-08-20 | 0.001 |
| 2015-08-21 | 0.001 |
| 2015-08-24 | 0.001 |
| 2015-08-25 | 0.001 |
| 2015-08-26 | 0.001 |
| 2015-08-27 | 0.001 |
| 2015-08-28 | 0.001 |
| 2015-08-31 | 0.001 |
| 2015-09-01 | 0.001 |
| 2015-09-02 | 0.001 |
| 2015-09-03 | 0.001 |
| 2015-09-04 | 0.001 |
| 2015-09-08 | 0.001 |
| 2015-09-09 | 0 |
| 2015-09-10 | 0 |
| 2015-09-11 | 0 |
| 2015-09-14 | 0 |
| 2015-09-15 | 0 |
| 2015-09-16 | 0 |
| 2015-09-17 | 0 |
| 2015-09-18 | 0 |
| 2015-09-21 | 0 |
| 2015-09-22 | 0 |
| 2015-09-24 | 0 |
| 2015-09-25 | 0 |
| 2015-09-28 | 0 |
| 2015-09-29 | 0.001 |
| 2015-09-30 | 0.001 |
| 2015-10-01 | 0.001 |
| 2015-10-02 | 0.001 |
| 2015-10-05 | 0.001 |
| 2015-10-06 | 0.001 |
| 2015-10-07 | 0 |
| 2015-10-08 | 0 |
| 2015-10-09 | 0 |
| 2015-10-13 | 0 |
| 2015-10-14 | 0 |
| 2015-10-15 | 0 |
| 2015-10-16 | 0 |
| 2015-10-19 | 0 |
| 2015-10-20 | 0 |
| 2015-10-21 | 0 |
| 2015-10-22 | 0 |
| 2015-10-23 | 0 |
| 2015-10-26 | 0 |
| 2015-10-27 | 0 |
| 2015-10-28 | 0 |
| 2015-10-29 | 0 |
| 2015-10-30 | 0 |
| 2015-11-02 | 0 |
| 2015-11-03 | 0 |
| 2015-11-04 | 0 |
| 2015-11-05 | 0 |
| 2015-11-06 | 0 |
| 2015-11-09 | 0 |
| 2015-11-10 | 0 |
| 2015-11-12 | 0 |
| 2015-11-13 | 0 |
| 2015-11-16 | 0 |
| 2015-11-17 | 0 |
| 2015-11-18 | 0 |
| 2015-11-19 | 0 |
| 2015-11-20 | 0 |
| 2015-11-23 | 0 |
| 2015-11-24 | 0 |
| 2015-11-27 | 0 |
| 2015-11-30 | 0 |
| 2015-12-01 | 0 |
| 2015-12-02 | 0 |
| 2015-12-03 | 0 |
| 2015-12-04 | 0 |
| 2015-12-07 | 0 |
| 2015-12-08 | 0 |
| 2015-12-09 | 0 |
| 2015-12-10 | 0 |
| 2015-12-11 | 0 |
| 2015-12-14 | 0 |
| 2015-12-15 | 0 |
| 2015-12-16 | 0 |
| 2015-12-17 | 0 |
| 2015-12-18 | 0 |
| 2015-12-21 | 0 |
| 2015-12-22 | 0 |
| 2015-12-23 | 0 |
| 2015-12-24 | 0 |
| 2015-12-28 | 0 |
| 2015-12-29 | 0 |
| 2015-12-30 | 0 |
| 2015-12-31 | 0 |
| 2016-01-04 | 0 |
| 2016-01-05 | 0 |
| 2016-01-06 | 0 |
| 2016-01-07 | 0 |
| 2016-01-08 | 0 |
| 2016-01-11 | 0 |
| 2016-01-12 | 0 |
| 2016-01-13 | 0.001 |
| 2016-01-14 | 0.001 |
| 2016-01-15 | 0.001 |
| 2016-01-19 | 0.001 |
| 2016-01-20 | 0.001 |
| 2016-01-21 | 0.001 |
| 2016-01-22 | 0.001 |
| 2016-01-25 | 0.001 |
| 2016-01-26 | 0.001 |
| 2016-01-27 | 0.001 |
| 2016-01-28 | 0.001 |
| 2016-01-29 | 0.001 |
| 2016-02-01 | 0.001 |
| 2016-02-02 | 0.001 |
| 2016-02-03 | 0.001 |
| 2016-02-04 | 0.001 |
| 2016-02-05 | 0.001 |
| 2016-02-08 | 0.001 |
| 2016-02-09 | 0.001 |
| 2016-02-10 | 0.001 |
| 2016-02-11 | 0.001 |
| 2016-02-12 | 0.001 |
| 2016-02-16 | 0.001 |
| 2016-02-17 | 0.001 |
| 2016-02-18 | 0.001 |
| 2016-02-19 | 0.001 |
| 2016-02-22 | 0.001 |
| 2016-02-23 | 0.001 |
| 2016-02-24 | 0.001 |
| 2016-02-25 | 0.001 |
| 2016-02-26 | 0.001 |
| 2016-02-29 | 0.001 |
| 2016-03-01 | 0.001 |
| 2016-03-02 | 0.001 |
| 2016-03-03 | 0.001 |
| 2016-03-04 | 0.001 |
| 2016-03-07 | 0 |
| 2016-03-08 | 0 |
| 2016-03-09 | 0 |
| 2016-03-10 | 0 |
| 2016-03-11 | 0 |
| 2016-03-14 | 0 |
| 2016-03-15 | 0 |
| 2016-03-16 | 0 |
| 2016-03-17 | 0 |
| 2016-03-18 | 0 |
| 2016-03-21 | 0 |
| 2016-03-22 | 0 |
| 2016-03-23 | 0 |
| 2016-03-24 | 0 |
| 2016-03-28 | 0 |
| 2016-03-29 | 0 |
| 2016-03-30 | 0 |
| 2016-03-31 | 0 |
| 2016-04-01 | 0 |
| 2016-04-04 | 0 |
| 2016-04-05 | 0 |
| 2016-04-06 | 0 |
| 2016-04-07 | 0 |
| 2016-04-08 | 0 |
| 2016-04-11 | 0 |
| 2016-04-12 | 0 |
| 2016-04-13 | 0 |
| 2016-04-14 | 0 |
| 2016-04-15 | 0 |
| 2016-04-18 | 0 |
| 2016-04-19 | 0 |
| 2016-04-20 | 0 |
| 2016-04-21 | 0 |
| 2016-04-22 | 0 |
| 2016-04-25 | -0.001 |
| 2016-04-26 | 0 |
| 2016-04-27 | 0 |
| 2016-04-28 | 0 |
| 2016-04-29 | -0.001 |
| 2016-05-02 | 0 |
| 2016-05-03 | 0 |
| 2016-05-04 | 0 |
| 2016-05-05 | 0 |
| 2016-05-06 | 0 |
| 2016-05-09 | 0 |
| 2016-05-10 | 0 |
| 2016-05-11 | 0 |
| 2016-05-12 | 0 |
| 2016-05-13 | 0 |
| 2016-05-16 | 0 |
| 2016-05-17 | 0 |
| 2016-05-18 | 0 |
| 2016-05-19 | 0 |
| 2016-05-20 | 0 |
| 2016-05-23 | 0 |
| 2016-05-24 | 0 |
| 2016-05-25 | 0 |
| 2016-05-26 | 0 |
| 2016-05-27 | 0 |
| 2016-06-02 | 0 |
| 2016-06-03 | 0 |
| 2016-06-06 | 0 |
| 2016-06-07 | 0 |
| 2016-06-08 | 0 |
| 2016-06-09 | 0 |
| 2016-06-10 | 0 |
| 2016-06-13 | 0 |
| 2016-06-14 | 0 |
| 2016-06-15 | 0 |
| 2016-06-16 | 0 |
| 2016-06-17 | 0 |
| 2016-06-20 | 0 |
| 2016-06-21 | 0 |
| 2016-06-22 | 0 |
| 2016-06-23 | 0 |
| 2016-06-24 | 0 |
| 2016-06-27 | 0 |
| 2016-06-28 | 0 |
| 2016-06-29 | 0 |
| 2016-06-30 | 0 |
| 2016-07-01 | 0 |
| 2016-07-05 | 0 |
| 2016-07-06 | 0 |
| 2016-07-07 | 0 |
| 2016-07-08 | 0 |
| 2016-07-11 | 0 |
| 2016-07-12 | 0 |
| 2016-07-13 | 0 |
| 2016-07-14 | 0 |
| 2016-07-15 | 0 |
| 2016-07-18 | 0 |
| 2016-07-19 | 0 |
| 2016-07-20 | 0 |
| 2016-07-21 | 0 |
| 2016-07-22 | 0 |
| 2016-07-25 | 0 |
| 2016-07-26 | 0 |
| 2016-07-27 | 0 |
| 2016-07-28 | 0 |
| 2016-07-29 | 0 |
| 2016-08-01 | 0 |
| 2016-08-02 | 0 |
| 2016-08-03 | 0 |
| 2016-08-04 | 0 |
| 2016-08-05 | 0 |
| 2016-08-08 | 0 |
| 2016-08-09 | 0 |
| 2016-08-10 | 0 |
| 2016-08-11 | 0 |
| 2016-08-12 | 0 |
| 2016-08-15 | 0 |
| 2016-08-16 | 0 |
| 2016-08-17 | 0 |
| 2016-08-18 | 0 |
| 2016-08-19 | 0 |
| 2016-08-22 | 0 |
| 2016-08-23 | 0 |
| 2016-08-24 | 0 |
| 2016-08-25 | 0 |
| 2016-08-26 | 0 |
| 2016-08-29 | 0 |
| 2016-08-30 | 0 |
| 2016-08-31 | 0 |
| 2016-09-01 | 0 |
| 2016-09-02 | 0 |
| 2016-09-06 | 0 |
| 2016-09-07 | 0 |
| 2016-09-08 | 0 |
| 2016-09-09 | 0 |
| 2016-09-12 | 0 |
| 2016-09-13 | 0 |
| 2016-09-14 | 0 |
| 2016-09-15 | 0 |
| 2016-09-16 | 0 |
| 2016-09-19 | 0 |
| 2016-09-20 | 0 |
| 2016-09-21 | 0 |
| 2016-09-22 | 0 |
| 2016-09-23 | 0 |
| 2016-09-26 | 0 |
| 2016-09-27 | 0 |
| 2016-09-28 | 0 |
| 2016-09-29 | 0 |
| 2016-09-30 | 0 |
| 2016-10-03 | 0 |
| 2016-10-04 | 0 |
| 2016-10-05 | 0 |
| 2016-10-06 | 0 |
| 2016-10-07 | 0 |
| 2016-10-11 | 0 |
| 2016-10-12 | 0 |
| 2016-10-13 | 0 |
| 2016-10-14 | 0 |
| 2016-10-17 | 0 |
| 2016-10-18 | 0 |
| 2016-10-19 | 0 |
| 2016-10-20 | 0 |
| 2016-10-21 | 0 |
| 2016-10-24 | 0 |
| 2016-10-25 | 0 |
| 2016-10-26 | 0 |
| 2016-10-27 | 0 |
| 2016-10-28 | 0 |
| 2016-10-31 | 0 |
| 2016-11-01 | 0 |
| 2016-11-02 | 0 |
| 2016-11-03 | 0.001 |
| 2016-11-04 | 0.001 |
| 2016-11-07 | 0.001 |
| 2016-11-08 | 0.001 |
| 2016-11-09 | 0.001 |
| 2016-11-10 | 0 |
| 2016-11-14 | 0 |
| 2016-11-15 | 0 |
| 2016-11-16 | 0 |
| 2016-11-17 | 0 |
| 2016-11-18 | 0 |
| 2016-11-21 | 0 |
| 2016-11-22 | 0 |
| 2016-11-25 | 0 |
| 2016-11-28 | 0 |
| 2016-11-29 | 0 |
| 2016-11-30 | 0 |
| 2016-12-01 | 0 |
| 2016-12-02 | 0 |
| 2016-12-05 | 0 |
| 2016-12-06 | 0 |
| 2016-12-07 | 0 |
| 2016-12-08 | 0 |
| 2016-12-09 | 0 |
| 2016-12-12 | 0 |
| 2016-12-13 | 0 |
| 2016-12-14 | 0 |
| 2016-12-15 | 0 |
| 2016-12-16 | 0 |
| 2016-12-19 | 0 |
| 2016-12-20 | 0 |
| 2016-12-21 | 0 |
| 2016-12-22 | 0 |
| 2016-12-23 | 0 |
| 2016-12-27 | 0 |
| 2016-12-28 | 0 |
| 2016-12-29 | 0 |
| 2016-12-30 | 0 |
| 2017-01-03 | 0 |
| 2017-01-04 | 0 |
| 2017-01-05 | 0 |
| 2017-01-06 | 0 |
| 2017-01-09 | 0 |
| 2017-01-10 | 0 |
| 2017-01-11 | 0 |
| 2017-01-12 | 0 |
| 2017-01-13 | 0 |
| 2017-01-17 | 0 |
| 2017-01-18 | 0 |
| 2017-01-19 | 0 |
| 2017-01-20 | 0 |
| 2017-01-23 | 0 |
| 2017-01-24 | 0 |
| 2017-01-25 | 0 |
| 2017-01-26 | 0 |
| 2017-01-27 | 0 |
| 2017-01-30 | 0 |
| 2017-01-31 | 0 |
| 2017-02-01 | 0 |
| 2017-02-02 | 0 |
| 2017-02-03 | 0 |
| 2017-02-06 | 0 |
| 2017-02-07 | 0 |
| 2017-02-08 | 0 |
| 2017-02-09 | 0 |
| 2017-02-10 | 0 |
| 2017-02-13 | 0 |
| 2017-02-14 | 0 |
| 2017-02-15 | 0 |
| 2017-02-16 | 0 |
| 2017-02-17 | 0 |
| 2017-02-21 | 0 |
| 2017-02-22 | 0 |
| 2017-02-23 | 0 |
| 2017-02-24 | 0 |
| 2017-02-27 | 0 |
| 2017-02-28 | 0 |
| 2017-03-01 | 0 |
| 2017-03-02 | 0 |
| 2017-03-03 | 0 |
| 2017-03-06 | 0 |
| 2017-03-07 | 0 |
| 2017-03-08 | 0 |
| 2017-03-09 | 0 |
| 2017-03-10 | 0 |
| 2017-03-13 | 0 |
| 2017-03-14 | 0 |
| 2017-03-15 | 0 |
| 2017-03-16 | 0 |
| 2017-03-17 | 0 |
| 2017-03-20 | 0 |
| 2017-03-21 | 0 |
| 2017-03-22 | 0 |
| 2017-03-23 | 0 |
| 2017-03-24 | 0 |
| 2017-03-27 | 0 |
| 2017-03-28 | 0 |
| 2017-03-29 | 0 |
| 2017-03-30 | 0 |
| 2017-03-31 | 0 |
| 2017-04-03 | 0 |
| 2017-04-04 | 0 |
| 2017-04-05 | 0 |
| 2017-04-06 | 0 |
| 2017-04-07 | 0 |
| 2017-04-10 | 0 |
| 2017-04-11 | 0 |
| 2017-04-12 | 0 |
| 2017-04-13 | 0 |
| 2017-04-17 | 0 |
| 2017-04-18 | 0 |
| 2017-04-19 | 0 |
| 2017-04-20 | 0 |
| 2017-04-21 | 0 |
| 2017-04-24 | 0 |
| 2017-04-25 | 0 |
| 2017-04-26 | 0 |
| 2017-04-27 | 0 |
| 2017-04-28 | 0 |
| 2017-05-01 | 0 |
| 2017-05-02 | 0 |
| 2017-05-03 | 0 |
| 2017-05-04 | 0 |
| 2017-05-05 | 0 |
| 2017-05-08 | 0 |
| 2017-05-09 | 0 |
| 2017-05-10 | 0 |
| 2017-05-11 | 0 |
| 2017-05-12 | 0 |
| 2017-05-15 | 0 |
| 2017-05-16 | 0 |
| 2017-05-17 | 0 |
| 2017-05-18 | 0 |
| 2017-05-19 | 0 |
| 2017-05-22 | 0 |
| 2017-05-23 | 0 |
| 2017-05-24 | 0 |
| 2017-05-25 | 0 |
| 2017-05-26 | 0 |
| 2017-05-30 | 0 |
| 2017-05-31 | 0 |
| 2017-06-01 | 0 |
| 2017-06-02 | 0 |
| 2017-06-05 | 0 |
| 2017-06-06 | 0 |
| 2017-06-07 | 0 |
| 2017-06-08 | 0 |
| 2017-06-09 | 0 |
| 2017-06-12 | 0 |
| 2017-06-13 | 0 |
| 2017-06-14 | 0 |
| 2017-06-15 | 0 |
| 2017-06-16 | 0 |
| 2017-06-19 | 0 |
| 2017-06-20 | 0 |
| 2017-06-21 | 0 |
| 2017-06-22 | 0 |
| 2017-06-23 | 0 |
| 2017-06-26 | 0 |
| 2017-06-27 | 0 |
| 2017-06-28 | 0 |
| 2017-06-29 | 0 |
| 2017-06-30 | 0 |
| 2017-07-03 | 0 |
| 2017-07-05 | 0 |
| 2017-07-06 | 0 |
| 2017-07-07 | 0 |
| 2017-07-10 | 0 |
| 2017-07-11 | 0 |
| 2017-07-12 | 0 |
| 2017-07-13 | 0 |
| 2017-07-14 | 0 |
| 2017-07-17 | 0 |
| 2017-07-18 | 0 |
| 2017-07-19 | 0 |
| 2017-07-20 | 0 |
| 2017-07-21 | 0 |
| 2017-07-24 | 0 |
| 2017-07-25 | 0 |
| 2017-07-26 | 0 |
| 2017-07-27 | 0 |
| 2017-07-28 | 0 |
| 2017-07-31 | 0 |
| 2017-08-01 | 0 |
| 2017-08-02 | 0 |
| 2017-08-03 | 0 |
| 2017-08-04 | 0 |
| 2017-08-07 | 0 |
| 2017-08-08 | 0 |
| 2017-08-09 | 0 |
| 2017-08-10 | 0 |
| 2017-08-11 | 0 |
| 2017-08-14 | 0 |
| 2017-08-15 | 0 |
| 2017-08-16 | 0 |
| 2017-08-17 | 0 |
| 2017-08-18 | 0 |
| 2017-08-21 | 0 |
| 2017-08-22 | 0 |
| 2017-08-23 | 0 |
| 2017-08-24 | 0 |
| 2017-08-25 | 0 |
| 2017-08-28 | 0 |
| 2017-08-29 | 0 |
| 2017-08-30 | 0 |
| 2017-08-31 | 0 |
| 2017-09-01 | 0 |
| 2017-09-05 | 0 |
| 2017-09-06 | 0 |
| 2017-09-07 | 0 |
| 2017-09-08 | 0 |
| 2017-09-11 | 0 |
| 2017-09-12 | 0 |
| 2017-09-13 | 0 |
| 2017-09-14 | 0 |
| 2017-09-15 | 0 |
| 2017-09-18 | 0 |
| 2017-09-19 | 0 |